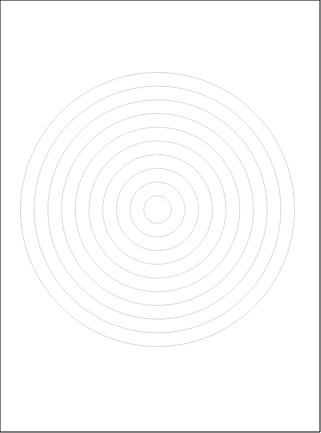
| Category | #REF! | C23 | C22 | C21 | E83 | E82 | E81 | E73 | E72 | E71 | E63 | E62 | E61 | E53 | E52 | E51 | E43 | E42 | E41 | E33 | E32 | E31 | E23 | E22 | E21 | E13 | E12 | E11 | D43 | D42 | D41 | D33 | D32 | D31 | D23 | D22 | D21 | D13 | D12 | D11 |
|---|---|---|---|---|---|---|---|---|---|---|---|---|---|---|---|---|---|---|---|---|---|---|---|---|---|---|---|---|---|---|---|---|---|---|---|---|---|---|---|---|
| 0.0 | 0 | 0 | 0 | 0 | 0 | 0 | 0 | 0 | 0 | 0 | 0 | 0 | 0 | 0 | 0 | 0 | 0 | 0 | 0 | 0 | 0 | 0 | 0 | 0 | 0 | 0 | 0 | 0 | 0 | 0 | 0 | 0 | 0 | 0 | 0 | 0 | 0 | 0 | 0 | 0 |
| 1.0 | 0 | 0 | 0 | 0 | 0 | 0 | 0 | 0 | 0 | 0 | 0 | 0 | 0 | 0 | 0 | 0 | 0 | 0 | 0 | 0 | 0 | 0 | 0 | 0 | 0 | 0 | 0 | 0 | 0 | 0 | 0 | 0 | 0 | 0 | 0 | 0 | 0 | 0 | 0 | 0 |
| 2.0 | 0 | 0 | 0 | 0 | 0 | 0 | 0 | 0 | 0 | 0 | 0 | 0 | 0 | 0 | 0 | 0 | 0 | 0 | 0 | 0 | 0 | 0 | 0 | 0 | 0 | 0 | 0 | 0 | 0 | 0 | 0 | 0 | 0 | 0 | 0 | 0 | 0 | 0 | 0 | 0 |
| 3.0 | 0 | 0 | 0 | 0 | 0 | 0 | 0 | 0 | 0 | 0 | 0 | 0 | 0 | 0 | 0 | 0 | 0 | 0 | 0 | 0 | 0 | 0 | 0 | 0 | 0 | 0 | 0 | 0 | 0 | 0 | 0 | 0 | 0 | 0 | 0 | 0 | 0 | 0 | 0 | 0 |
| 4.0 | 0 | 0 | 0 | 0 | 0 | 0 | 0 | 0 | 0 | 0 | 0 | 0 | 0 | 0 | 0 | 0 | 0 | 0 | 0 | 0 | 0 | 0 | 0 | 0 | 0 | 0 | 0 | 0 | 0 | 0 | 0 | 0 | 0 | 0 | 0 | 0 | 0 | 0 | 0 | 0 |
| 5.0 | 0 | 0 | 0 | 0 | 0 | 0 | 0 | 0 | 0 | 0 | 0 | 0 | 0 | 0 | 0 | 0 | 0 | 0 | 0 | 0 | 0 | 0 | 0 | 0 | 0 | 0 | 0 | 0 | 0 | 0 | 0 | 0 | 0 | 0 | 0 | 0 | 0 | 0 | 0 | 0 |
| 6.0 | 0 | 0 | 0 | 0 | 0 | 0 | 0 | 0 | 0 | 0 | 0 | 0 | 0 | 0 | 0 | 0 | 0 | 0 | 0 | 0 | 0 | 0 | 0 | 0 | 0 | 0 | 0 | 0 | 0 | 0 | 0 | 0 | 0 | 0 | 0 | 0 | 0 | 0 | 0 | 0 |
| 7.0 | 0 | 0 | 0 | 0 | 0 | 0 | 0 | 0 | 0 | 0 | 0 | 0 | 0 | 0 | 0 | 0 | 0 | 0 | 0 | 0 | 0 | 0 | 0 | 0 | 0 | 0 | 0 | 0 | 0 | 0 | 0 | 0 | 0 | 0 | 0 | 0 | 0 | 0 | 0 | 0 |
| 8.0 | 0 | 0 | 0 | 0 | 0 | 0 | 0 | 0 | 0 | 0 | 0 | 0 | 0 | 0 | 0 | 0 | 0 | 0 | 0 | 0 | 0 | 0 | 0 | 0 | 0 | 0 | 0 | 0 | 0 | 0 | 0 | 0 | 0 | 0 | 0 | 0 | 0 | 0 | 0 | 0 |
| 9.0 | 0 | 0 | 0 | 0 | 0 | 0 | 0 | 0 | 0 | 0 | 0 | 0 | 0 | 0 | 0 | 0 | 0 | 0 | 0 | 0 | 0 | 0 | 0 | 0 | 0 | 0 | 0 | 0 | 0 | 0 | 0 | 0 | 0 | 0 | 0 | 0 | 0 | 0 | 0 | 0 |
| 10.0 | 0 | 0 | 0 | 0 | 0 | 0 | 0 | 0 | 0 | 0 | 0 | 0 | 0 | 0 | 0 | 0 | 0 | 0 | 0 | 0 | 0 | 0 | 0 | 0 | 0 | 0 | 0 | 0 | 0 | 0 | 0 | 0 | 0 | 0 | 0 | 0 | 0 | 0 | 0 | 0 |
| 11.0 | 0 | 0 | 0 | 0 | 0 | 0 | 0 | 0 | 0 | 0 | 0 | 0 | 0 | 0 | 0 | 0 | 0 | 0 | 0 | 0 | 0 | 0 | 0 | 0 | 0 | 0 | 0 | 0 | 0 | 0 | 0 | 0 | 0 | 0 | 0 | 0 | 0 | 0 | 0 | 0 |
| 12.0 | 0 | 0 | 0 | 0 | 0 | 0 | 0 | 0 | 0 | 0 | 0 | 0 | 0 | 0 | 0 | 0 | 0 | 0 | 0 | 0 | 0 | 0 | 0 | 0 | 0 | 0 | 0 | 0 | 0 | 0 | 0 | 0 | 0 | 0 | 0 | 0 | 0 | 0 | 0 | 0 |
| 13.0 | 0 | 0 | 0 | 0 | 0 | 0 | 0 | 0 | 0 | 0 | 0 | 0 | 0 | 0 | 0 | 0 | 0 | 0 | 0 | 0 | 0 | 0 | 0 | 0 | 0 | 0 | 0 | 0 | 0 | 0 | 0 | 0 | 0 | 0 | 0 | 0 | 0 | 0 | 0 | 0 |
| 14.0 | 0 | 0 | 0 | 0 | 0 | 0 | 0 | 0 | 0 | 0 | 0 | 0 | 0 | 0 | 0 | 0 | 0 | 0 | 0 | 0 | 0 | 0 | 0 | 0 | 0 | 0 | 0 | 0 | 0 | 0 | 0 | 0 | 0 | 0 | 0 | 0 | 0 | 0 | 0 | 0 |
| 15.0 | 0 | 0 | 0 | 0 | 0 | 0 | 0 | 0 | 0 | 0 | 0 | 0 | 0 | 0 | 0 | 0 | 0 | 0 | 0 | 0 | 0 | 0 | 0 | 0 | 0 | 0 | 0 | 0 | 0 | 0 | 0 | 0 | 0 | 0 | 0 | 0 | 0 | 0 | 0 | 0 |
| 16.0 | 0 | 0 | 0 | 0 | 0 | 0 | 0 | 0 | 0 | 0 | 0 | 0 | 0 | 0 | 0 | 0 | 0 | 0 | 0 | 0 | 0 | 0 | 0 | 0 | 0 | 0 | 0 | 0 | 0 | 0 | 0 | 0 | 0 | 0 | 0 | 0 | 0 | 0 | 0 | 0 |
| 17.0 | 0 | 0 | 0 | 0 | 0 | 0 | 0 | 0 | 0 | 0 | 0 | 0 | 0 | 0 | 0 | 0 | 0 | 0 | 0 | 0 | 0 | 0 | 0 | 0 | 0 | 0 | 0 | 0 | 0 | 0 | 0 | 0 | 0 | 0 | 0 | 0 | 0 | 0 | 0 | 0 |
| 18.0 | 0 | 0 | 0 | 0 | 0 | 0 | 0 | 0 | 0 | 0 | 0 | 0 | 0 | 0 | 0 | 0 | 0 | 0 | 0 | 0 | 0 | 0 | 0 | 0 | 0 | 0 | 0 | 0 | 0 | 0 | 0 | 0 | 0 | 0 | 0 | 0 | 0 | 0 | 0 | 0 |
| 19.0 | 0 | 0 | 0 | 0 | 0 | 0 | 0 | 0 | 0 | 0 | 0 | 0 | 0 | 0 | 0 | 0 | 0 | 0 | 0 | 0 | 0 | 0 | 0 | 0 | 0 | 0 | 0 | 0 | 0 | 0 | 0 | 0 | 0 | 0 | 0 | 0 | 0 | 0 | 0 | 0 |
| 20.0 | 0 | 0 | 0 | 0 | 0 | 0 | 0 | 0 | 0 | 0 | 0 | 0 | 0 | 0 | 0 | 0 | 0 | 0 | 0 | 0 | 0 | 0 | 0 | 0 | 0 | 0 | 0 | 0 | 0 | 0 | 0 | 0 | 0 | 0 | 0 | 0 | 0 | 0 | 0 | 0 |
| 21.0 | 0 | 0 | 0 | 0 | 0 | 0 | 0 | 0 | 0 | 0 | 0 | 0 | 0 | 0 | 0 | 0 | 0 | 0 | 0 | 0 | 0 | 0 | 0 | 0 | 0 | 0 | 0 | 0 | 0 | 0 | 0 | 0 | 0 | 0 | 0 | 0 | 0 | 0 | 0 | 0 |
| 22.0 | 0 | 0 | 0 | 0 | 0 | 0 | 0 | 0 | 0 | 0 | 0 | 0 | 0 | 0 | 0 | 0 | 0 | 0 | 0 | 0 | 0 | 0 | 0 | 0 | 0 | 0 | 0 | 0 | 0 | 0 | 0 | 0 | 0 | 0 | 0 | 0 | 0 | 0 | 0 | 0 |
| 23.0 | 0 | 0 | 0 | 0 | 0 | 0 | 0 | 0 | 0 | 0 | 0 | 0 | 0 | 0 | 0 | 0 | 0 | 0 | 0 | 0 | 0 | 0 | 0 | 0 | 0 | 0 | 0 | 0 | 0 | 0 | 0 | 0 | 0 | 0 | 0 | 0 | 0 | 0 | 0 | 0 |
| 24.0 | 0 | 0 | 0 | 0 | 0 | 0 | 0 | 0 | 0 | 0 | 0 | 0 | 0 | 0 | 0 | 0 | 0 | 0 | 0 | 0 | 0 | 0 | 0 | 0 | 0 | 0 | 0 | 0 | 0 | 0 | 0 | 0 | 0 | 0 | 0 | 0 | 0 | 0 | 0 | 0 |
| 25.0 | 0 | 0 | 0 | 0 | 0 | 0 | 0 | 0 | 0 | 0 | 0 | 0 | 0 | 0 | 0 | 0 | 0 | 0 | 0 | 0 | 0 | 0 | 0 | 0 | 0 | 0 | 0 | 0 | 0 | 0 | 0 | 0 | 0 | 0 | 0 | 0 | 0 | 0 | 0 | 0 |
| 26.0 | 0 | 0 | 0 | 0 | 0 | 0 | 0 | 0 | 0 | 0 | 0 | 0 | 0 | 0 | 0 | 0 | 0 | 0 | 0 | 0 | 0 | 0 | 0 | 0 | 0 | 0 | 0 | 0 | 0 | 0 | 0 | 0 | 0 | 0 | 0 | 0 | 0 | 0 | 0 | 0 |
| 27.0 | 0 | 0 | 0 | 0 | 0 | 0 | 0 | 0 | 0 | 0 | 0 | 0 | 0 | 0 | 0 | 0 | 0 | 0 | 0 | 0 | 0 | 0 | 0 | 0 | 0 | 0 | 0 | 0 | 0 | 0 | 0 | 0 | 0 | 0 | 0 | 0 | 0 | 0 | 0 | 0 |
| 28.0 | 0 | 0 | 0 | 0 | 0 | 0 | 0 | 0 | 0 | 0 | 0 | 0 | 0 | 0 | 0 | 0 | 0 | 0 | 0 | 0 | 0 | 0 | 0 | 0 | 0 | 0 | 0 | 0 | 0 | 0 | 0 | 0 | 0 | 0 | 0 | 0 | 0 | 0 | 0 | 0 |
| 29.0 | 0 | 0 | 0 | 0 | 0 | 0 | 0 | 0 | 0 | 0 | 0 | 0 | 0 | 0 | 0 | 0 | 0 | 0 | 0 | 0 | 0 | 0 | 0 | 0 | 0 | 0 | 0 | 0 | 0 | 0 | 0 | 0 | 0 | 0 | 0 | 0 | 0 | 0 | 0 | 0 |
| 30.0 | 0 | 0 | 0 | 0 | 0 | 0 | 0 | 0 | 0 | 0 | 0 | 0 | 0 | 0 | 0 | 0 | 0 | 0 | 0 | 0 | 0 | 0 | 0 | 0 | 0 | 0 | 0 | 0 | 0 | 0 | 0 | 0 | 0 | 0 | 0 | 0 | 0 | 0 | 0 | 0 |
| 31.0 | 0 | 0 | 0 | 0 | 0 | 0 | 0 | 0 | 0 | 0 | 0 | 0 | 0 | 0 | 0 | 0 | 0 | 0 | 0 | 0 | 0 | 0 | 0 | 0 | 0 | 0 | 0 | 0 | 0 | 0 | 0 | 0 | 0 | 0 | 0 | 0 | 0 | 0 | 0 | 0 |
| 32.0 | 0 | 0 | 0 | 0 | 0 | 0 | 0 | 0 | 0 | 0 | 0 | 0 | 0 | 0 | 0 | 0 | 0 | 0 | 0 | 0 | 0 | 0 | 0 | 0 | 0 | 0 | 0 | 0 | 0 | 0 | 0 | 0 | 0 | 0 | 0 | 0 | 0 | 0 | 0 | 0 |
| 33.0 | 0 | 0 | 0 | 0 | 0 | 0 | 0 | 0 | 0 | 0 | 0 | 0 | 0 | 0 | 0 | 0 | 0 | 0 | 0 | 0 | 0 | 0 | 0 | 0 | 0 | 0 | 0 | 0 | 0 | 0 | 0 | 0 | 0 | 0 | 0 | 0 | 0 | 0 | 0 | 0 |
| 34.0 | 0 | 0 | 0 | 0 | 0 | 0 | 0 | 0 | 0 | 0 | 0 | 0 | 0 | 0 | 0 | 0 | 0 | 0 | 0 | 0 | 0 | 0 | 0 | 0 | 0 | 0 | 0 | 0 | 0 | 0 | 0 | 0 | 0 | 0 | 0 | 0 | 0 | 0 | 0 | 0 |
| 35.0 | 0 | 0 | 0 | 0 | 0 | 0 | 0 | 0 | 0 | 0 | 0 | 0 | 0 | 0 | 0 | 0 | 0 | 0 | 0 | 0 | 0 | 0 | 0 | 0 | 0 | 0 | 0 | 0 | 0 | 0 | 0 | 0 | 0 | 0 | 0 | 0 | 0 | 0 | 0 | 0 |
| 36.0 | 0 | 0 | 0 | 0 | 0 | 0 | 0 | 0 | 0 | 0 | 0 | 0 | 0 | 0 | 0 | 0 | 0 | 0 | 0 | 0 | 0 | 0 | 0 | 0 | 0 | 0 | 0 | 0 | 0 | 0 | 0 | 0 | 0 | 0 | 0 | 0 | 0 | 0 | 0 | 0 |
| 37.0 | 0 | 0 | 0 | 0 | 0 | 0 | 0 | 0 | 0 | 0 | 0 | 0 | 0 | 0 | 0 | 0 | 0 | 0 | 0 | 0 | 0 | 0 | 0 | 0 | 0 | 0 | 0 | 0 | 0 | 0 | 0 | 0 | 0 | 0 | 0 | 0 | 0 | 0 | 0 | 0 |
| 38.0 | 0 | 0 | 0 | 0 | 0 | 0 | 0 | 0 | 0 | 0 | 0 | 0 | 0 | 0 | 0 | 0 | 0 | 0 | 0 | 0 | 0 | 0 | 0 | 0 | 0 | 0 | 0 | 0 | 0 | 0 | 0 | 0 | 0 | 0 | 0 | 0 | 0 | 0 | 0 | 0 |
| 39.0 | 0 | 0 | 0 | 0 | 0 | 0 | 0 | 0 | 0 | 0 | 0 | 0 | 0 | 0 | 0 | 0 | 0 | 0 | 0 | 0 | 0 | 0 | 0 | 0 | 0 | 0 | 0 | 0 | 0 | 0 | 0 | 0 | 0 | 0 | 0 | 0 | 0 | 0 | 0 | 0 |
| 40.0 | 0 | 0 | 0 | 0 | 0 | 0 | 0 | 0 | 0 | 0 | 0 | 0 | 0 | 0 | 0 | 0 | 0 | 0 | 0 | 0 | 0 | 0 | 0 | 0 | 0 | 0 | 0 | 0 | 0 | 0 | 0 | 0 | 0 | 0 | 0 | 0 | 0 | 0 | 0 | 0 |
| 41.0 | 0 | 0 | 0 | 0 | 0 | 0 | 0 | 0 | 0 | 0 | 0 | 0 | 0 | 0 | 0 | 0 | 0 | 0 | 0 | 0 | 0 | 0 | 0 | 0 | 0 | 0 | 0 | 0 | 0 | 0 | 0 | 0 | 0 | 0 | 0 | 0 | 0 | 0 | 0 | 0 |
| 42.0 | 0 | 0 | 0 | 0 | 0 | 0 | 0 | 0 | 0 | 0 | 0 | 0 | 0 | 0 | 0 | 0 | 0 | 0 | 0 | 0 | 0 | 0 | 0 | 0 | 0 | 0 | 0 | 0 | 0 | 0 | 0 | 0 | 0 | 0 | 0 | 0 | 0 | 0 | 0 | 0 |
| 43.0 | 0 | 0 | 0 | 0 | 0 | 0 | 0 | 0 | 0 | 0 | 0 | 0 | 0 | 0 | 0 | 0 | 0 | 0 | 0 | 0 | 0 | 0 | 0 | 0 | 0 | 0 | 0 | 0 | 0 | 0 | 0 | 0 | 0 | 0 | 0 | 0 | 0 | 0 | 0 | 0 |
| 44.0 | 0 | 0 | 0 | 0 | 0 | 0 | 0 | 0 | 0 | 0 | 0 | 0 | 0 | 0 | 0 | 0 | 0 | 0 | 0 | 0 | 0 | 0 | 0 | 0 | 0 | 0 | 0 | 0 | 0 | 0 | 0 | 0 | 0 | 0 | 0 | 0 | 0 | 0 | 0 | 0 |
| 45.0 | 0 | 0 | 0 | 0 | 0 | 0 | 0 | 0 | 0 | 0 | 0 | 0 | 0 | 0 | 0 | 0 | 0 | 0 | 0 | 0 | 0 | 0 | 0 | 0 | 0 | 0 | 0 | 0 | 0 | 0 | 0 | 0 | 0 | 0 | 0 | 0 | 0 | 0 | 0 | 0 |
| 46.0 | 0 | 0 | 0 | 0 | 0 | 0 | 0 | 0 | 0 | 0 | 0 | 0 | 0 | 0 | 0 | 0 | 0 | 0 | 0 | 0 | 0 | 0 | 0 | 0 | 0 | 0 | 0 | 0 | 0 | 0 | 0 | 0 | 0 | 0 | 0 | 0 | 0 | 0 | 0 | 0 |
| 47.0 | 0 | 0 | 0 | 0 | 0 | 0 | 0 | 0 | 0 | 0 | 0 | 0 | 0 | 0 | 0 | 0 | 0 | 0 | 0 | 0 | 0 | 0 | 0 | 0 | 0 | 0 | 0 | 0 | 0 | 0 | 0 | 0 | 0 | 0 | 0 | 0 | 0 | 0 | 0 | 0 |
| 48.0 | 0 | 0 | 0 | 0 | 0 | 0 | 0 | 0 | 0 | 0 | 0 | 0 | 0 | 0 | 0 | 0 | 0 | 0 | 0 | 0 | 0 | 0 | 0 | 0 | 0 | 0 | 0 | 0 | 0 | 0 | 0 | 0 | 0 | 0 | 0 | 0 | 0 | 0 | 0 | 0 |
| 49.0 | 0 | 0 | 0 | 0 | 0 | 0 | 0 | 0 | 0 | 0 | 0 | 0 | 0 | 0 | 0 | 0 | 0 | 0 | 0 | 0 | 0 | 0 | 0 | 0 | 0 | 0 | 0 | 0 | 0 | 0 | 0 | 0 | 0 | 0 | 0 | 0 | 0 | 0 | 0 | 0 |
| 50.0 | 0 | 0 | 0 | 0 | 0 | 0 | 0 | 0 | 0 | 0 | 0 | 0 | 0 | 0 | 0 | 0 | 0 | 0 | 0 | 0 | 0 | 0 | 0 | 0 | 0 | 0 | 0 | 0 | 0 | 0 | 0 | 0 | 0 | 0 | 0 | 0 | 0 | 0 | 0 | 0 |
| 51.0 | 0 | 0 | 0 | 0 | 0 | 0 | 0 | 0 | 0 | 0 | 0 | 0 | 0 | 0 | 0 | 0 | 0 | 0 | 0 | 0 | 0 | 0 | 0 | 0 | 0 | 0 | 0 | 0 | 0 | 0 | 0 | 0 | 0 | 0 | 0 | 0 | 0 | 0 | 0 | 0 |
| 52.0 | 0 | 0 | 0 | 0 | 0 | 0 | 0 | 0 | 0 | 0 | 0 | 0 | 0 | 0 | 0 | 0 | 0 | 0 | 0 | 0 | 0 | 0 | 0 | 0 | 0 | 0 | 0 | 0 | 0 | 0 | 0 | 0 | 0 | 0 | 0 | 0 | 0 | 0 | 0 | 0 |
| 53.0 | 0 | 0 | 0 | 0 | 0 | 0 | 0 | 0 | 0 | 0 | 0 | 0 | 0 | 0 | 0 | 0 | 0 | 0 | 0 | 0 | 0 | 0 | 0 | 0 | 0 | 0 | 0 | 0 | 0 | 0 | 0 | 0 | 0 | 0 | 0 | 0 | 0 | 0 | 0 | 0 |
| 54.0 | 0 | 0 | 0 | 0 | 0 | 0 | 0 | 0 | 0 | 0 | 0 | 0 | 0 | 0 | 0 | 0 | 0 | 0 | 0 | 0 | 0 | 0 | 0 | 0 | 0 | 0 | 0 | 0 | 0 | 0 | 0 | 0 | 0 | 0 | 0 | 0 | 0 | 0 | 0 | 0 |
| 55.0 | 0 | 0 | 0 | 0 | 0 | 0 | 0 | 0 | 0 | 0 | 0 | 0 | 0 | 0 | 0 | 0 | 0 | 0 | 0 | 0 | 0 | 0 | 0 | 0 | 0 | 0 | 0 | 0 | 0 | 0 | 0 | 0 | 0 | 0 | 0 | 0 | 0 | 0 | 0 | 0 |
| 56.0 | 0 | 0 | 0 | 0 | 0 | 0 | 0 | 0 | 0 | 0 | 0 | 0 | 0 | 0 | 0 | 0 | 0 | 0 | 0 | 0 | 0 | 0 | 0 | 0 | 0 | 0 | 0 | 0 | 0 | 0 | 0 | 0 | 0 | 0 | 0 | 0 | 0 | 0 | 0 | 0 |
| 57.0 | 0 | 0 | 0 | 0 | 0 | 0 | 0 | 0 | 0 | 0 | 0 | 0 | 0 | 0 | 0 | 0 | 0 | 0 | 0 | 0 | 0 | 0 | 0 | 0 | 0 | 0 | 0 | 0 | 0 | 0 | 0 | 0 | 0 | 0 | 0 | 0 | 0 | 0 | 0 | 0 |
| 58.0 | 0 | 0 | 0 | 0 | 0 | 0 | 0 | 0 | 0 | 0 | 0 | 0 | 0 | 0 | 0 | 0 | 0 | 0 | 0 | 0 | 0 | 0 | 0 | 0 | 0 | 0 | 0 | 0 | 0 | 0 | 0 | 0 | 0 | 0 | 0 | 0 | 0 | 0 | 0 | 0 |
| 59.0 | 0 | 0 | 0 | 0 | 0 | 0 | 0 | 0 | 0 | 0 | 0 | 0 | 0 | 0 | 0 | 0 | 0 | 0 | 0 | 0 | 0 | 0 | 0 | 0 | 0 | 0 | 0 | 0 | 0 | 0 | 0 | 0 | 0 | 0 | 0 | 0 | 0 | 0 | 0 | 0 |
| 60.0 | 0 | 0 | 0 | 0 | 0 | 0 | 0 | 0 | 0 | 0 | 0 | 0 | 0 | 0 | 0 | 0 | 0 | 0 | 0 | 0 | 0 | 0 | 0 | 0 | 0 | 0 | 0 | 0 | 0 | 0 | 0 | 0 | 0 | 0 | 0 | 0 | 0 | 0 | 0 | 0 |
| 61.0 | 0 | 0 | 0 | 0 | 0 | 0 | 0 | 0 | 0 | 0 | 0 | 0 | 0 | 0 | 0 | 0 | 0 | 0 | 0 | 0 | 0 | 0 | 0 | 0 | 0 | 0 | 0 | 0 | 0 | 0 | 0 | 0 | 0 | 0 | 0 | 0 | 0 | 0 | 0 | 0 |
| 62.0 | 0 | 0 | 0 | 0 | 0 | 0 | 0 | 0 | 0 | 0 | 0 | 0 | 0 | 0 | 0 | 0 | 0 | 0 | 0 | 0 | 0 | 0 | 0 | 0 | 0 | 0 | 0 | 0 | 0 | 0 | 0 | 0 | 0 | 0 | 0 | 0 | 0 | 0 | 0 | 0 |
| 63.0 | 0 | 0 | 0 | 0 | 0 | 0 | 0 | 0 | 0 | 0 | 0 | 0 | 0 | 0 | 0 | 0 | 0 | 0 | 0 | 0 | 0 | 0 | 0 | 0 | 0 | 0 | 0 | 0 | 0 | 0 | 0 | 0 | 0 | 0 | 0 | 0 | 0 | 0 | 0 | 0 |
| 64.0 | 0 | 0 | 0 | 0 | 0 | 0 | 0 | 0 | 0 | 0 | 0 | 0 | 0 | 0 | 0 | 0 | 0 | 0 | 0 | 0 | 0 | 0 | 0 | 0 | 0 | 0 | 0 | 0 | 0 | 0 | 0 | 0 | 0 | 0 | 0 | 0 | 0 | 0 | 0 | 0 |
| 65.0 | 0 | 0 | 0 | 0 | 0 | 0 | 0 | 0 | 0 | 0 | 0 | 0 | 0 | 0 | 0 | 0 | 0 | 0 | 0 | 0 | 0 | 0 | 0 | 0 | 0 | 0 | 0 | 0 | 0 | 0 | 0 | 0 | 0 | 0 | 0 | 0 | 0 | 0 | 0 | 0 |
| 66.0 | 0 | 0 | 0 | 0 | 0 | 0 | 0 | 0 | 0 | 0 | 0 | 0 | 0 | 0 | 0 | 0 | 0 | 0 | 0 | 0 | 0 | 0 | 0 | 0 | 0 | 0 | 0 | 0 | 0 | 0 | 0 | 0 | 0 | 0 | 0 | 0 | 0 | 0 | 0 | 0 |
| 67.0 | 0 | 0 | 0 | 0 | 0 | 0 | 0 | 0 | 0 | 0 | 0 | 0 | 0 | 0 | 0 | 0 | 0 | 0 | 0 | 0 | 0 | 0 | 0 | 0 | 0 | 0 | 0 | 0 | 0 | 0 | 0 | 0 | 0 | 0 | 0 | 0 | 0 | 0 | 0 | 0 |
| 68.0 | 0 | 0 | 0 | 0 | 0 | 0 | 0 | 0 | 0 | 0 | 0 | 0 | 0 | 0 | 0 | 0 | 0 | 0 | 0 | 0 | 0 | 0 | 0 | 0 | 0 | 0 | 0 | 0 | 0 | 0 | 0 | 0 | 0 | 0 | 0 | 0 | 0 | 0 | 0 | 0 |
| 69.0 | 0 | 0 | 0 | 0 | 0 | 0 | 0 | 0 | 0 | 0 | 0 | 0 | 0 | 0 | 0 | 0 | 0 | 0 | 0 | 0 | 0 | 0 | 0 | 0 | 0 | 0 | 0 | 0 | 0 | 0 | 0 | 0 | 0 | 0 | 0 | 0 | 0 | 0 | 0 | 0 |
| 70.0 | 0 | 0 | 0 | 0 | 0 | 0 | 0 | 0 | 0 | 0 | 0 | 0 | 0 | 0 | 0 | 0 | 0 | 0 | 0 | 0 | 0 | 0 | 0 | 0 | 0 | 0 | 0 | 0 | 0 | 0 | 0 | 0 | 0 | 0 | 0 | 0 | 0 | 0 | 0 | 0 |
| 71.0 | 0 | 0 | 0 | 0 | 0 | 0 | 0 | 0 | 0 | 0 | 0 | 0 | 0 | 0 | 0 | 0 | 0 | 0 | 0 | 0 | 0 | 0 | 0 | 0 | 0 | 0 | 0 | 0 | 0 | 0 | 0 | 0 | 0 | 0 | 0 | 0 | 0 | 0 | 0 | 0 |
| 72.0 | 0 | 0 | 0 | 0 | 0 | 0 | 0 | 0 | 0 | 0 | 0 | 0 | 0 | 0 | 0 | 0 | 0 | 0 | 0 | 0 | 0 | 0 | 0 | 0 | 0 | 0 | 0 | 0 | 0 | 0 | 0 | 0 | 0 | 0 | 0 | 0 | 0 | 0 | 0 | 0 |
| 73.0 | 0 | 0 | 0 | 0 | 0 | 0 | 0 | 0 | 0 | 0 | 0 | 0 | 0 | 0 | 0 | 0 | 0 | 0 | 0 | 0 | 0 | 0 | 0 | 0 | 0 | 0 | 0 | 0 | 0 | 0 | 0 | 0 | 0 | 0 | 0 | 0 | 0 | 0 | 0 | 0 |
| 74.0 | 0 | 0 | 0 | 0 | 0 | 0 | 0 | 0 | 0 | 0 | 0 | 0 | 0 | 0 | 0 | 0 | 0 | 0 | 0 | 0 | 0 | 0 | 0 | 0 | 0 | 0 | 0 | 0 | 0 | 0 | 0 | 0 | 0 | 0 | 0 | 0 | 0 | 0 | 0 | 0 |
| 75.0 | 0 | 0 | 0 | 0 | 0 | 0 | 0 | 0 | 0 | 0 | 0 | 0 | 0 | 0 | 0 | 0 | 0 | 0 | 0 | 0 | 0 | 0 | 0 | 0 | 0 | 0 | 0 | 0 | 0 | 0 | 0 | 0 | 0 | 0 | 0 | 0 | 0 | 0 | 0 | 0 |
| 76.0 | 0 | 0 | 0 | 0 | 0 | 0 | 0 | 0 | 0 | 0 | 0 | 0 | 0 | 0 | 0 | 0 | 0 | 0 | 0 | 0 | 0 | 0 | 0 | 0 | 0 | 0 | 0 | 0 | 0 | 0 | 0 | 0 | 0 | 0 | 0 | 0 | 0 | 0 | 0 | 0 |
| 77.0 | 0 | 0 | 0 | 0 | 0 | 0 | 0 | 0 | 0 | 0 | 0 | 0 | 0 | 0 | 0 | 0 | 0 | 0 | 0 | 0 | 0 | 0 | 0 | 0 | 0 | 0 | 0 | 0 | 0 | 0 | 0 | 0 | 0 | 0 | 0 | 0 | 0 | 0 | 0 | 0 |
| 78.0 | 0 | 0 | 0 | 0 | 0 | 0 | 0 | 0 | 0 | 0 | 0 | 0 | 0 | 0 | 0 | 0 | 0 | 0 | 0 | 0 | 0 | 0 | 0 | 0 | 0 | 0 | 0 | 0 | 0 | 0 | 0 | 0 | 0 | 0 | 0 | 0 | 0 | 0 | 0 | 0 |
| 79.0 | 0 | 0 | 0 | 0 | 0 | 0 | 0 | 0 | 0 | 0 | 0 | 0 | 0 | 0 | 0 | 0 | 0 | 0 | 0 | 0 | 0 | 0 | 0 | 0 | 0 | 0 | 0 | 0 | 0 | 0 | 0 | 0 | 0 | 0 | 0 | 0 | 0 | 0 | 0 | 0 |
| 80.0 | 0 | 0 | 0 | 0 | 0 | 0 | 0 | 0 | 0 | 0 | 0 | 0 | 0 | 0 | 0 | 0 | 0 | 0 | 0 | 0 | 0 | 0 | 0 | 0 | 0 | 0 | 0 | 0 | 0 | 0 | 0 | 0 | 0 | 0 | 0 | 0 | 0 | 0 | 0 | 0 |
| 81.0 | 0 | 0 | 0 | 0 | 0 | 0 | 0 | 0 | 0 | 0 | 0 | 0 | 0 | 0 | 0 | 0 | 0 | 0 | 0 | 0 | 0 | 0 | 0 | 0 | 0 | 0 | 0 | 0 | 0 | 0 | 0 | 0 | 0 | 0 | 0 | 0 | 0 | 0 | 0 | 0 |
| 82.0 | 0 | 0 | 0 | 0 | 0 | 0 | 0 | 0 | 0 | 0 | 0 | 0 | 0 | 0 | 0 | 0 | 0 | 0 | 0 | 0 | 0 | 0 | 0 | 0 | 0 | 0 | 0 | 0 | 0 | 0 | 0 | 0 | 0 | 0 | 0 | 0 | 0 | 0 | 0 | 0 |
| 83.0 | 0 | 0 | 0 | 0 | 0 | 0 | 0 | 0 | 0 | 0 | 0 | 0 | 0 | 0 | 0 | 0 | 0 | 0 | 0 | 0 | 0 | 0 | 0 | 0 | 0 | 0 | 0 | 0 | 0 | 0 | 0 | 0 | 0 | 0 | 0 | 0 | 0 | 0 | 0 | 0 |
| 84.0 | 0 | 0 | 0 | 0 | 0 | 0 | 0 | 0 | 0 | 0 | 0 | 0 | 0 | 0 | 0 | 0 | 0 | 0 | 0 | 0 | 0 | 0 | 0 | 0 | 0 | 0 | 0 | 0 | 0 | 0 | 0 | 0 | 0 | 0 | 0 | 0 | 0 | 0 | 0 | 0 |
| 85.0 | 0 | 0 | 0 | 0 | 0 | 0 | 0 | 0 | 0 | 0 | 0 | 0 | 0 | 0 | 0 | 0 | 0 | 0 | 0 | 0 | 0 | 0 | 0 | 0 | 0 | 0 | 0 | 0 | 0 | 0 | 0 | 0 | 0 | 0 | 0 | 0 | 0 | 0 | 0 | 0 |
| 86.0 | 0 | 0 | 0 | 0 | 0 | 0 | 0 | 0 | 0 | 0 | 0 | 0 | 0 | 0 | 0 | 0 | 0 | 0 | 0 | 0 | 0 | 0 | 0 | 0 | 0 | 0 | 0 | 0 | 0 | 0 | 0 | 0 | 0 | 0 | 0 | 0 | 0 | 0 | 0 | 0 |
| 87.0 | 0 | 0 | 0 | 0 | 0 | 0 | 0 | 0 | 0 | 0 | 0 | 0 | 0 | 0 | 0 | 0 | 0 | 0 | 0 | 0 | 0 | 0 | 0 | 0 | 0 | 0 | 0 | 0 | 0 | 0 | 0 | 0 | 0 | 0 | 0 | 0 | 0 | 0 | 0 | 0 |
| 88.0 | 0 | 0 | 0 | 0 | 0 | 0 | 0 | 0 | 0 | 0 | 0 | 0 | 0 | 0 | 0 | 0 | 0 | 0 | 0 | 0 | 0 | 0 | 0 | 0 | 0 | 0 | 0 | 0 | 0 | 0 | 0 | 0 | 0 | 0 | 0 | 0 | 0 | 0 | 0 | 0 |
| 89.0 | 0 | 0 | 0 | 0 | 0 | 0 | 0 | 0 | 0 | 0 | 0 | 0 | 0 | 0 | 0 | 0 | 0 | 0 | 0 | 0 | 0 | 0 | 0 | 0 | 0 | 0 | 0 | 0 | 0 | 0 | 0 | 0 | 0 | 0 | 0 | 0 | 0 | 0 | 0 | 0 |
| 90.0 | 0 | 0 | 0 | 0 | 0 | 0 | 0 | 0 | 0 | 0 | 0 | 0 | 0 | 0 | 0 | 0 | 0 | 0 | 0 | 0 | 0 | 0 | 0 | 0 | 0 | 0 | 0 | 0 | 0 | 0 | 0 | 0 | 0 | 0 | 0 | 0 | 0 | 0 | 0 | 0 |
| 91.0 | 0 | 0 | 0 | 0 | 0 | 0 | 0 | 0 | 0 | 0 | 0 | 0 | 0 | 0 | 0 | 0 | 0 | 0 | 0 | 0 | 0 | 0 | 0 | 0 | 0 | 0 | 0 | 0 | 0 | 0 | 0 | 0 | 0 | 0 | 0 | 0 | 0 | 0 | 0 | 0 |
| 92.0 | 0 | 0 | 0 | 0 | 0 | 0 | 0 | 0 | 0 | 0 | 0 | 0 | 0 | 0 | 0 | 0 | 0 | 0 | 0 | 0 | 0 | 0 | 0 | 0 | 0 | 0 | 0 | 0 | 0 | 0 | 0 | 0 | 0 | 0 | 0 | 0 | 0 | 0 | 0 | 0 |
| 93.0 | 0 | 0 | 0 | 0 | 0 | 0 | 0 | 0 | 0 | 0 | 0 | 0 | 0 | 0 | 0 | 0 | 0 | 0 | 0 | 0 | 0 | 0 | 0 | 0 | 0 | 0 | 0 | 0 | 0 | 0 | 0 | 0 | 0 | 0 | 0 | 0 | 0 | 0 | 0 | 0 |
| 94.0 | 0 | 0 | 0 | 0 | 0 | 0 | 0 | 0 | 0 | 0 | 0 | 0 | 0 | 0 | 0 | 0 | 0 | 0 | 0 | 0 | 0 | 0 | 0 | 0 | 0 | 0 | 0 | 0 | 0 | 0 | 0 | 0 | 0 | 0 | 0 | 0 | 0 | 0 | 0 | 0 |
| 95.0 | 0 | 0 | 0 | 0 | 0 | 0 | 0 | 0 | 0 | 0 | 0 | 0 | 0 | 0 | 0 | 0 | 0 | 0 | 0 | 0 | 0 | 0 | 0 | 0 | 0 | 0 | 0 | 0 | 0 | 0 | 0 | 0 | 0 | 0 | 0 | 0 | 0 | 0 | 0 | 0 |
| 96.0 | 0 | 0 | 0 | 0 | 0 | 0 | 0 | 0 | 0 | 0 | 0 | 0 | 0 | 0 | 0 | 0 | 0 | 0 | 0 | 0 | 0 | 0 | 0 | 0 | 0 | 0 | 0 | 0 | 0 | 0 | 0 | 0 | 0 | 0 | 0 | 0 | 0 | 0 | 0 | 0 |
| 97.0 | 0 | 0 | 0 | 0 | 0 | 0 | 0 | 0 | 0 | 0 | 0 | 0 | 0 | 0 | 0 | 0 | 0 | 0 | 0 | 0 | 0 | 0 | 0 | 0 | 0 | 0 | 0 | 0 | 0 | 0 | 0 | 0 | 0 | 0 | 0 | 0 | 0 | 0 | 0 | 0 |
| 98.0 | 0 | 0 | 0 | 0 | 0 | 0 | 0 | 0 | 0 | 0 | 0 | 0 | 0 | 0 | 0 | 0 | 0 | 0 | 0 | 0 | 0 | 0 | 0 | 0 | 0 | 0 | 0 | 0 | 0 | 0 | 0 | 0 | 0 | 0 | 0 | 0 | 0 | 0 | 0 | 0 |
| 99.0 | 0 | 0 | 0 | 0 | 0 | 0 | 0 | 0 | 0 | 0 | 0 | 0 | 0 | 0 | 0 | 0 | 0 | 0 | 0 | 0 | 0 | 0 | 0 | 0 | 0 | 0 | 0 | 0 | 0 | 0 | 0 | 0 | 0 | 0 | 0 | 0 | 0 | 0 | 0 | 0 |
| 100.0 | 0 | 0 | 0 | 0 | 0 | 0 | 0 | 0 | 0 | 0 | 0 | 0 | 0 | 0 | 0 | 0 | 0 | 0 | 0 | 0 | 0 | 0 | 0 | 0 | 0 | 0 | 0 | 0 | 0 | 0 | 0 | 0 | 0 | 0 | 0 | 0 | 0 | 0 | 0 | 0 |
| 101.0 | 0 | 0 | 0 | 0 | 0 | 0 | 0 | 0 | 0 | 0 | 0 | 0 | 0 | 0 | 0 | 0 | 0 | 0 | 0 | 0 | 0 | 0 | 0 | 0 | 0 | 0 | 0 | 0 | 0 | 0 | 0 | 0 | 0 | 0 | 0 | 0 | 0 | 0 | 0 | 0 |
| 102.0 | 0 | 0 | 0 | 0 | 0 | 0 | 0 | 0 | 0 | 0 | 0 | 0 | 0 | 0 | 0 | 0 | 0 | 0 | 0 | 0 | 0 | 0 | 0 | 0 | 0 | 0 | 0 | 0 | 0 | 0 | 0 | 0 | 0 | 0 | 0 | 0 | 0 | 0 | 0 | 0 |
| 103.0 | 0 | 0 | 0 | 0 | 0 | 0 | 0 | 0 | 0 | 0 | 0 | 0 | 0 | 0 | 0 | 0 | 0 | 0 | 0 | 0 | 0 | 0 | 0 | 0 | 0 | 0 | 0 | 0 | 0 | 0 | 0 | 0 | 0 | 0 | 0 | 0 | 0 | 0 | 0 | 0 |
| 104.0 | 0 | 0 | 0 | 0 | 0 | 0 | 0 | 0 | 0 | 0 | 0 | 0 | 0 | 0 | 0 | 0 | 0 | 0 | 0 | 0 | 0 | 0 | 0 | 0 | 0 | 0 | 0 | 0 | 0 | 0 | 0 | 0 | 0 | 0 | 0 | 0 | 0 | 0 | 0 | 0 |
| 105.0 | 0 | 0 | 0 | 0 | 0 | 0 | 0 | 0 | 0 | 0 | 0 | 0 | 0 | 0 | 0 | 0 | 0 | 0 | 0 | 0 | 0 | 0 | 0 | 0 | 0 | 0 | 0 | 0 | 0 | 0 | 0 | 0 | 0 | 0 | 0 | 0 | 0 | 0 | 0 | 0 |
| 106.0 | 0 | 0 | 0 | 0 | 0 | 0 | 0 | 0 | 0 | 0 | 0 | 0 | 0 | 0 | 0 | 0 | 0 | 0 | 0 | 0 | 0 | 0 | 0 | 0 | 0 | 0 | 0 | 0 | 0 | 0 | 0 | 0 | 0 | 0 | 0 | 0 | 0 | 0 | 0 | 0 |
| 107.0 | 0 | 0 | 0 | 0 | 0 | 0 | 0 | 0 | 0 | 0 | 0 | 0 | 0 | 0 | 0 | 0 | 0 | 0 | 0 | 0 | 0 | 0 | 0 | 0 | 0 | 0 | 0 | 0 | 0 | 0 | 0 | 0 | 0 | 0 | 0 | 0 | 0 | 0 | 0 | 0 |
| 108.0 | 0 | 0 | 0 | 0 | 0 | 0 | 0 | 0 | 0 | 0 | 0 | 0 | 0 | 0 | 0 | 0 | 0 | 0 | 0 | 0 | 0 | 0 | 0 | 0 | 0 | 0 | 0 | 0 | 0 | 0 | 0 | 0 | 0 | 0 | 0 | 0 | 0 | 0 | 0 | 0 |
| 109.0 | 0 | 0 | 0 | 0 | 0 | 0 | 0 | 0 | 0 | 0 | 0 | 0 | 0 | 0 | 0 | 0 | 0 | 0 | 0 | 0 | 0 | 0 | 0 | 0 | 0 | 0 | 0 | 0 | 0 | 0 | 0 | 0 | 0 | 0 | 0 | 0 | 0 | 0 | 0 | 0 |
| 110.0 | 0 | 0 | 0 | 0 | 0 | 0 | 0 | 0 | 0 | 0 | 0 | 0 | 0 | 0 | 0 | 0 | 0 | 0 | 0 | 0 | 0 | 0 | 0 | 0 | 0 | 0 | 0 | 0 | 0 | 0 | 0 | 0 | 0 | 0 | 0 | 0 | 0 | 0 | 0 | 0 |
| 111.0 | 0 | 0 | 0 | 0 | 0 | 0 | 0 | 0 | 0 | 0 | 0 | 0 | 0 | 0 | 0 | 0 | 0 | 0 | 0 | 0 | 0 | 0 | 0 | 0 | 0 | 0 | 0 | 0 | 0 | 0 | 0 | 0 | 0 | 0 | 0 | 0 | 0 | 0 | 0 | 0 |
| 112.0 | 0 | 0 | 0 | 0 | 0 | 0 | 0 | 0 | 0 | 0 | 0 | 0 | 0 | 0 | 0 | 0 | 0 | 0 | 0 | 0 | 0 | 0 | 0 | 0 | 0 | 0 | 0 | 0 | 0 | 0 | 0 | 0 | 0 | 0 | 0 | 0 | 0 | 0 | 0 | 0 |
| 113.0 | 0 | 0 | 0 | 0 | 0 | 0 | 0 | 0 | 0 | 0 | 0 | 0 | 0 | 0 | 0 | 0 | 0 | 0 | 0 | 0 | 0 | 0 | 0 | 0 | 0 | 0 | 0 | 0 | 0 | 0 | 0 | 0 | 0 | 0 | 0 | 0 | 0 | 0 | 0 | 0 |
| 114.0 | 0 | 0 | 0 | 0 | 0 | 0 | 0 | 0 | 0 | 0 | 0 | 0 | 0 | 0 | 0 | 0 | 0 | 0 | 0 | 0 | 0 | 0 | 0 | 0 | 0 | 0 | 0 | 0 | 0 | 0 | 0 | 0 | 0 | 0 | 0 | 0 | 0 | 0 | 0 | 0 |
| 115.0 | 0 | 0 | 0 | 0 | 0 | 0 | 0 | 0 | 0 | 0 | 0 | 0 | 0 | 0 | 0 | 0 | 0 | 0 | 0 | 0 | 0 | 0 | 0 | 0 | 0 | 0 | 0 | 0 | 0 | 0 | 0 | 0 | 0 | 0 | 0 | 0 | 0 | 0 | 0 | 0 |
| 116.0 | 0 | 0 | 0 | 0 | 0 | 0 | 0 | 0 | 0 | 0 | 0 | 0 | 0 | 0 | 0 | 0 | 0 | 0 | 0 | 0 | 0 | 0 | 0 | 0 | 0 | 0 | 0 | 0 | 0 | 0 | 0 | 0 | 0 | 0 | 0 | 0 | 0 | 0 | 0 | 0 |
| 117.0 | 0 | 0 | 0 | 0 | 0 | 0 | 0 | 0 | 0 | 0 | 0 | 0 | 0 | 0 | 0 | 0 | 0 | 0 | 0 | 0 | 0 | 0 | 0 | 0 | 0 | 0 | 0 | 0 | 0 | 0 | 0 | 0 | 0 | 0 | 0 | 0 | 0 | 0 | 0 | 0 |
| 118.0 | 0 | 0 | 0 | 0 | 0 | 0 | 0 | 0 | 0 | 0 | 0 | 0 | 0 | 0 | 0 | 0 | 0 | 0 | 0 | 0 | 0 | 0 | 0 | 0 | 0 | 0 | 0 | 0 | 0 | 0 | 0 | 0 | 0 | 0 | 0 | 0 | 0 | 0 | 0 | 0 |
| 119.0 | 0 | 0 | 0 | 0 | 0 | 0 | 0 | 0 | 0 | 0 | 0 | 0 | 0 | 0 | 0 | 0 | 0 | 0 | 0 | 0 | 0 | 0 | 0 | 0 | 0 | 0 | 0 | 0 | 0 | 0 | 0 | 0 | 0 | 0 | 0 | 0 | 0 | 0 | 0 | 0 |
| 120.0 | 0 | 0 | 0 | 0 | 0 | 0 | 0 | 0 | 0 | 0 | 0 | 0 | 0 | 0 | 0 | 0 | 0 | 0 | 0 | 0 | 0 | 0 | 0 | 0 | 0 | 0 | 0 | 0 | 0 | 0 | 0 | 0 | 0 | 0 | 0 | 0 | 0 | 0 | 0 | 0 |
| 121.0 | 0 | 0 | 0 | 0 | 0 | 0 | 0 | 0 | 0 | 0 | 0 | 0 | 0 | 0 | 0 | 0 | 0 | 0 | 0 | 0 | 0 | 0 | 0 | 0 | 0 | 0 | 0 | 0 | 0 | 0 | 0 | 0 | 0 | 0 | 0 | 0 | 0 | 0 | 0 | 0 |
| 122.0 | 0 | 0 | 0 | 0 | 0 | 0 | 0 | 0 | 0 | 0 | 0 | 0 | 0 | 0 | 0 | 0 | 0 | 0 | 0 | 0 | 0 | 0 | 0 | 0 | 0 | 0 | 0 | 0 | 0 | 0 | 0 | 0 | 0 | 0 | 0 | 0 | 0 | 0 | 0 | 0 |
| 123.0 | 0 | 0 | 0 | 0 | 0 | 0 | 0 | 0 | 0 | 0 | 0 | 0 | 0 | 0 | 0 | 0 | 0 | 0 | 0 | 0 | 0 | 0 | 0 | 0 | 0 | 0 | 0 | 0 | 0 | 0 | 0 | 0 | 0 | 0 | 0 | 0 | 0 | 0 | 0 | 0 |
| 124.0 | 0 | 0 | 0 | 0 | 0 | 0 | 0 | 0 | 0 | 0 | 0 | 0 | 0 | 0 | 0 | 0 | 0 | 0 | 0 | 0 | 0 | 0 | 0 | 0 | 0 | 0 | 0 | 0 | 0 | 0 | 0 | 0 | 0 | 0 | 0 | 0 | 0 | 0 | 0 | 0 |
| 125.0 | 0 | 0 | 0 | 0 | 0 | 0 | 0 | 0 | 0 | 0 | 0 | 0 | 0 | 0 | 0 | 0 | 0 | 0 | 0 | 0 | 0 | 0 | 0 | 0 | 0 | 0 | 0 | 0 | 0 | 0 | 0 | 0 | 0 | 0 | 0 | 0 | 0 | 0 | 0 | 0 |
| 126.0 | 0 | 0 | 0 | 0 | 0 | 0 | 0 | 0 | 0 | 0 | 0 | 0 | 0 | 0 | 0 | 0 | 0 | 0 | 0 | 0 | 0 | 0 | 0 | 0 | 0 | 0 | 0 | 0 | 0 | 0 | 0 | 0 | 0 | 0 | 0 | 0 | 0 | 0 | 0 | 0 |
| 127.0 | 0 | 0 | 0 | 0 | 0 | 0 | 0 | 0 | 0 | 0 | 0 | 0 | 0 | 0 | 0 | 0 | 0 | 0 | 0 | 0 | 0 | 0 | 0 | 0 | 0 | 0 | 0 | 0 | 0 | 0 | 0 | 0 | 0 | 0 | 0 | 0 | 0 | 0 | 0 | 0 |
| 128.0 | 0 | 0 | 0 | 0 | 0 | 0 | 0 | 0 | 0 | 0 | 0 | 0 | 0 | 0 | 0 | 0 | 0 | 0 | 0 | 0 | 0 | 0 | 0 | 0 | 0 | 0 | 0 | 0 | 0 | 0 | 0 | 0 | 0 | 0 | 0 | 0 | 0 | 0 | 0 | 0 |
| 129.0 | 0 | 0 | 0 | 0 | 0 | 0 | 0 | 0 | 0 | 0 | 0 | 0 | 0 | 0 | 0 | 0 | 0 | 0 | 0 | 0 | 0 | 0 | 0 | 0 | 0 | 0 | 0 | 0 | 0 | 0 | 0 | 0 | 0 | 0 | 0 | 0 | 0 | 0 | 0 | 0 |
| 130.0 | 0 | 0 | 0 | 0 | 0 | 0 | 0 | 0 | 0 | 0 | 0 | 0 | 0 | 0 | 0 | 0 | 0 | 0 | 0 | 0 | 0 | 0 | 0 | 0 | 0 | 0 | 0 | 0 | 0 | 0 | 0 | 0 | 0 | 0 | 0 | 0 | 0 | 0 | 0 | 0 |
| 131.0 | 0 | 0 | 0 | 0 | 0 | 0 | 0 | 0 | 0 | 0 | 0 | 0 | 0 | 0 | 0 | 0 | 0 | 0 | 0 | 0 | 0 | 0 | 0 | 0 | 0 | 0 | 0 | 0 | 0 | 0 | 0 | 0 | 0 | 0 | 0 | 0 | 0 | 0 | 0 | 0 |
| 132.0 | 0 | 0 | 0 | 0 | 0 | 0 | 0 | 0 | 0 | 0 | 0 | 0 | 0 | 0 | 0 | 0 | 0 | 0 | 0 | 0 | 0 | 0 | 0 | 0 | 0 | 0 | 0 | 0 | 0 | 0 | 0 | 0 | 0 | 0 | 0 | 0 | 0 | 0 | 0 | 0 |
| 133.0 | 0 | 0 | 0 | 0 | 0 | 0 | 0 | 0 | 0 | 0 | 0 | 0 | 0 | 0 | 0 | 0 | 0 | 0 | 0 | 0 | 0 | 0 | 0 | 0 | 0 | 0 | 0 | 0 | 0 | 0 | 0 | 0 | 0 | 0 | 0 | 0 | 0 | 0 | 0 | 0 |
| 134.0 | 0 | 0 | 0 | 0 | 0 | 0 | 0 | 0 | 0 | 0 | 0 | 0 | 0 | 0 | 0 | 0 | 0 | 0 | 0 | 0 | 0 | 0 | 0 | 0 | 0 | 0 | 0 | 0 | 0 | 0 | 0 | 0 | 0 | 0 | 0 | 0 | 0 | 0 | 0 | 0 |
| 135.0 | 0 | 0 | 0 | 0 | 0 | 0 | 0 | 0 | 0 | 0 | 0 | 0 | 0 | 0 | 0 | 0 | 0 | 0 | 0 | 0 | 0 | 0 | 0 | 0 | 0 | 0 | 0 | 0 | 0 | 0 | 0 | 0 | 0 | 0 | 0 | 0 | 0 | 0 | 0 | 0 |
| 136.0 | 0 | 0 | 0 | 0 | 0 | 0 | 0 | 0 | 0 | 0 | 0 | 0 | 0 | 0 | 0 | 0 | 0 | 0 | 0 | 0 | 0 | 0 | 0 | 0 | 0 | 0 | 0 | 0 | 0 | 0 | 0 | 0 | 0 | 0 | 0 | 0 | 0 | 0 | 0 | 0 |
| 137.0 | 0 | 0 | 0 | 0 | 0 | 0 | 0 | 0 | 0 | 0 | 0 | 0 | 0 | 0 | 0 | 0 | 0 | 0 | 0 | 0 | 0 | 0 | 0 | 0 | 0 | 0 | 0 | 0 | 0 | 0 | 0 | 0 | 0 | 0 | 0 | 0 | 0 | 0 | 0 | 0 |
| 138.0 | 0 | 0 | 0 | 0 | 0 | 0 | 0 | 0 | 0 | 0 | 0 | 0 | 0 | 0 | 0 | 0 | 0 | 0 | 0 | 0 | 0 | 0 | 0 | 0 | 0 | 0 | 0 | 0 | 0 | 0 | 0 | 0 | 0 | 0 | 0 | 0 | 0 | 0 | 0 | 0 |
| 139.0 | 0 | 0 | 0 | 0 | 0 | 0 | 0 | 0 | 0 | 0 | 0 | 0 | 0 | 0 | 0 | 0 | 0 | 0 | 0 | 0 | 0 | 0 | 0 | 0 | 0 | 0 | 0 | 0 | 0 | 0 | 0 | 0 | 0 | 0 | 0 | 0 | 0 | 0 | 0 | 0 |
| 140.0 | 0 | 0 | 0 | 0 | 0 | 0 | 0 | 0 | 0 | 0 | 0 | 0 | 0 | 0 | 0 | 0 | 0 | 0 | 0 | 0 | 0 | 0 | 0 | 0 | 0 | 0 | 0 | 0 | 0 | 0 | 0 | 0 | 0 | 0 | 0 | 0 | 0 | 0 | 0 | 0 |
| 141.0 | 0 | 0 | 0 | 0 | 0 | 0 | 0 | 0 | 0 | 0 | 0 | 0 | 0 | 0 | 0 | 0 | 0 | 0 | 0 | 0 | 0 | 0 | 0 | 0 | 0 | 0 | 0 | 0 | 0 | 0 | 0 | 0 | 0 | 0 | 0 | 0 | 0 | 0 | 0 | 0 |
| 142.0 | 0 | 0 | 0 | 0 | 0 | 0 | 0 | 0 | 0 | 0 | 0 | 0 | 0 | 0 | 0 | 0 | 0 | 0 | 0 | 0 | 0 | 0 | 0 | 0 | 0 | 0 | 0 | 0 | 0 | 0 | 0 | 0 | 0 | 0 | 0 | 0 | 0 | 0 | 0 | 0 |
| 143.0 | 0 | 0 | 0 | 0 | 0 | 0 | 0 | 0 | 0 | 0 | 0 | 0 | 0 | 0 | 0 | 0 | 0 | 0 | 0 | 0 | 0 | 0 | 0 | 0 | 0 | 0 | 0 | 0 | 0 | 0 | 0 | 0 | 0 | 0 | 0 | 0 | 0 | 0 | 0 | 0 |
| 144.0 | 0 | 0 | 0 | 0 | 0 | 0 | 0 | 0 | 0 | 0 | 0 | 0 | 0 | 0 | 0 | 0 | 0 | 0 | 0 | 0 | 0 | 0 | 0 | 0 | 0 | 0 | 0 | 0 | 0 | 0 | 0 | 0 | 0 | 0 | 0 | 0 | 0 | 0 | 0 | 0 |
| 145.0 | 0 | 0 | 0 | 0 | 0 | 0 | 0 | 0 | 0 | 0 | 0 | 0 | 0 | 0 | 0 | 0 | 0 | 0 | 0 | 0 | 0 | 0 | 0 | 0 | 0 | 0 | 0 | 0 | 0 | 0 | 0 | 0 | 0 | 0 | 0 | 0 | 0 | 0 | 0 | 0 |
| 146.0 | 0 | 0 | 0 | 0 | 0 | 0 | 0 | 0 | 0 | 0 | 0 | 0 | 0 | 0 | 0 | 0 | 0 | 0 | 0 | 0 | 0 | 0 | 0 | 0 | 0 | 0 | 0 | 0 | 0 | 0 | 0 | 0 | 0 | 0 | 0 | 0 | 0 | 0 | 0 | 0 |
| 147.0 | 0 | 0 | 0 | 0 | 0 | 0 | 0 | 0 | 0 | 0 | 0 | 0 | 0 | 0 | 0 | 0 | 0 | 0 | 0 | 0 | 0 | 0 | 0 | 0 | 0 | 0 | 0 | 0 | 0 | 0 | 0 | 0 | 0 | 0 | 0 | 0 | 0 | 0 | 0 | 0 |
| 148.0 | 0 | 0 | 0 | 0 | 0 | 0 | 0 | 0 | 0 | 0 | 0 | 0 | 0 | 0 | 0 | 0 | 0 | 0 | 0 | 0 | 0 | 0 | 0 | 0 | 0 | 0 | 0 | 0 | 0 | 0 | 0 | 0 | 0 | 0 | 0 | 0 | 0 | 0 | 0 | 0 |
| 149.0 | 0 | 0 | 0 | 0 | 0 | 0 | 0 | 0 | 0 | 0 | 0 | 0 | 0 | 0 | 0 | 0 | 0 | 0 | 0 | 0 | 0 | 0 | 0 | 0 | 0 | 0 | 0 | 0 | 0 | 0 | 0 | 0 | 0 | 0 | 0 | 0 | 0 | 0 | 0 | 0 |
| 150.0 | 0 | 0 | 0 | 0 | 0 | 0 | 0 | 0 | 0 | 0 | 0 | 0 | 0 | 0 | 0 | 0 | 0 | 0 | 0 | 0 | 0 | 0 | 0 | 0 | 0 | 0 | 0 | 0 | 0 | 0 | 0 | 0 | 0 | 0 | 0 | 0 | 0 | 0 | 0 | 0 |
| 151.0 | 0 | 0 | 0 | 0 | 0 | 0 | 0 | 0 | 0 | 0 | 0 | 0 | 0 | 0 | 0 | 0 | 0 | 0 | 0 | 0 | 0 | 0 | 0 | 0 | 0 | 0 | 0 | 0 | 0 | 0 | 0 | 0 | 0 | 0 | 0 | 0 | 0 | 0 | 0 | 0 |
| 152.0 | 0 | 0 | 0 | 0 | 0 | 0 | 0 | 0 | 0 | 0 | 0 | 0 | 0 | 0 | 0 | 0 | 0 | 0 | 0 | 0 | 0 | 0 | 0 | 0 | 0 | 0 | 0 | 0 | 0 | 0 | 0 | 0 | 0 | 0 | 0 | 0 | 0 | 0 | 0 | 0 |
| 153.0 | 0 | 0 | 0 | 0 | 0 | 0 | 0 | 0 | 0 | 0 | 0 | 0 | 0 | 0 | 0 | 0 | 0 | 0 | 0 | 0 | 0 | 0 | 0 | 0 | 0 | 0 | 0 | 0 | 0 | 0 | 0 | 0 | 0 | 0 | 0 | 0 | 0 | 0 | 0 | 0 |
| 154.0 | 0 | 0 | 0 | 0 | 0 | 0 | 0 | 0 | 0 | 0 | 0 | 0 | 0 | 0 | 0 | 0 | 0 | 0 | 0 | 0 | 0 | 0 | 0 | 0 | 0 | 0 | 0 | 0 | 0 | 0 | 0 | 0 | 0 | 0 | 0 | 0 | 0 | 0 | 0 | 0 |
| 155.0 | 0 | 0 | 0 | 0 | 0 | 0 | 0 | 0 | 0 | 0 | 0 | 0 | 0 | 0 | 0 | 0 | 0 | 0 | 0 | 0 | 0 | 0 | 0 | 0 | 0 | 0 | 0 | 0 | 0 | 0 | 0 | 0 | 0 | 0 | 0 | 0 | 0 | 0 | 0 | 0 |
| 156.0 | 0 | 0 | 0 | 0 | 0 | 0 | 0 | 0 | 0 | 0 | 0 | 0 | 0 | 0 | 0 | 0 | 0 | 0 | 0 | 0 | 0 | 0 | 0 | 0 | 0 | 0 | 0 | 0 | 0 | 0 | 0 | 0 | 0 | 0 | 0 | 0 | 0 | 0 | 0 | 0 |
| 157.0 | 0 | 0 | 0 | 0 | 0 | 0 | 0 | 0 | 0 | 0 | 0 | 0 | 0 | 0 | 0 | 0 | 0 | 0 | 0 | 0 | 0 | 0 | 0 | 0 | 0 | 0 | 0 | 0 | 0 | 0 | 0 | 0 | 0 | 0 | 0 | 0 | 0 | 0 | 0 | 0 |
| 158.0 | 0 | 0 | 0 | 0 | 0 | 0 | 0 | 0 | 0 | 0 | 0 | 0 | 0 | 0 | 0 | 0 | 0 | 0 | 0 | 0 | 0 | 0 | 0 | 0 | 0 | 0 | 0 | 0 | 0 | 0 | 0 | 0 | 0 | 0 | 0 | 0 | 0 | 0 | 0 | 0 |
| 159.0 | 0 | 0 | 0 | 0 | 0 | 0 | 0 | 0 | 0 | 0 | 0 | 0 | 0 | 0 | 0 | 0 | 0 | 0 | 0 | 0 | 0 | 0 | 0 | 0 | 0 | 0 | 0 | 0 | 0 | 0 | 0 | 0 | 0 | 0 | 0 | 0 | 0 | 0 | 0 | 0 |
| 160.0 | 0 | 0 | 0 | 0 | 0 | 0 | 0 | 0 | 0 | 0 | 0 | 0 | 0 | 0 | 0 | 0 | 0 | 0 | 0 | 0 | 0 | 0 | 0 | 0 | 0 | 0 | 0 | 0 | 0 | 0 | 0 | 0 | 0 | 0 | 0 | 0 | 0 | 0 | 0 | 0 |
| 161.0 | 0 | 0 | 0 | 0 | 0 | 0 | 0 | 0 | 0 | 0 | 0 | 0 | 0 | 0 | 0 | 0 | 0 | 0 | 0 | 0 | 0 | 0 | 0 | 0 | 0 | 0 | 0 | 0 | 0 | 0 | 0 | 0 | 0 | 0 | 0 | 0 | 0 | 0 | 0 | 0 |
| 162.0 | 0 | 0 | 0 | 0 | 0 | 0 | 0 | 0 | 0 | 0 | 0 | 0 | 0 | 0 | 0 | 0 | 0 | 0 | 0 | 0 | 0 | 0 | 0 | 0 | 0 | 0 | 0 | 0 | 0 | 0 | 0 | 0 | 0 | 0 | 0 | 0 | 0 | 0 | 0 | 0 |
| 163.0 | 0 | 0 | 0 | 0 | 0 | 0 | 0 | 0 | 0 | 0 | 0 | 0 | 0 | 0 | 0 | 0 | 0 | 0 | 0 | 0 | 0 | 0 | 0 | 0 | 0 | 0 | 0 | 0 | 0 | 0 | 0 | 0 | 0 | 0 | 0 | 0 | 0 | 0 | 0 | 0 |
| 164.0 | 0 | 0 | 0 | 0 | 0 | 0 | 0 | 0 | 0 | 0 | 0 | 0 | 0 | 0 | 0 | 0 | 0 | 0 | 0 | 0 | 0 | 0 | 0 | 0 | 0 | 0 | 0 | 0 | 0 | 0 | 0 | 0 | 0 | 0 | 0 | 0 | 0 | 0 | 0 | 0 |
| 165.0 | 0 | 0 | 0 | 0 | 0 | 0 | 0 | 0 | 0 | 0 | 0 | 0 | 0 | 0 | 0 | 0 | 0 | 0 | 0 | 0 | 0 | 0 | 0 | 0 | 0 | 0 | 0 | 0 | 0 | 0 | 0 | 0 | 0 | 0 | 0 | 0 | 0 | 0 | 0 | 0 |
| 166.0 | 0 | 0 | 0 | 0 | 0 | 0 | 0 | 0 | 0 | 0 | 0 | 0 | 0 | 0 | 0 | 0 | 0 | 0 | 0 | 0 | 0 | 0 | 0 | 0 | 0 | 0 | 0 | 0 | 0 | 0 | 0 | 0 | 0 | 0 | 0 | 0 | 0 | 0 | 0 | 0 |
| 167.0 | 0 | 0 | 0 | 0 | 0 | 0 | 0 | 0 | 0 | 0 | 0 | 0 | 0 | 0 | 0 | 0 | 0 | 0 | 0 | 0 | 0 | 0 | 0 | 0 | 0 | 0 | 0 | 0 | 0 | 0 | 0 | 0 | 0 | 0 | 0 | 0 | 0 | 0 | 0 | 0 |
| 168.0 | 0 | 0 | 0 | 0 | 0 | 0 | 0 | 0 | 0 | 0 | 0 | 0 | 0 | 0 | 0 | 0 | 0 | 0 | 0 | 0 | 0 | 0 | 0 | 0 | 0 | 0 | 0 | 0 | 0 | 0 | 0 | 0 | 0 | 0 | 0 | 0 | 0 | 0 | 0 | 0 |
| 169.0 | 0 | 0 | 0 | 0 | 0 | 0 | 0 | 0 | 0 | 0 | 0 | 0 | 0 | 0 | 0 | 0 | 0 | 0 | 0 | 0 | 0 | 0 | 0 | 0 | 0 | 0 | 0 | 0 | 0 | 0 | 0 | 0 | 0 | 0 | 0 | 0 | 0 | 0 | 0 | 0 |
| 170.0 | 0 | 0 | 0 | 0 | 0 | 0 | 0 | 0 | 0 | 0 | 0 | 0 | 0 | 0 | 0 | 0 | 0 | 0 | 0 | 0 | 0 | 0 | 0 | 0 | 0 | 0 | 0 | 0 | 0 | 0 | 0 | 0 | 0 | 0 | 0 | 0 | 0 | 0 | 0 | 0 |
| 171.0 | 0 | 0 | 0 | 0 | 0 | 0 | 0 | 0 | 0 | 0 | 0 | 0 | 0 | 0 | 0 | 0 | 0 | 0 | 0 | 0 | 0 | 0 | 0 | 0 | 0 | 0 | 0 | 0 | 0 | 0 | 0 | 0 | 0 | 0 | 0 | 0 | 0 | 0 | 0 | 0 |
| 172.0 | 0 | 0 | 0 | 0 | 0 | 0 | 0 | 0 | 0 | 0 | 0 | 0 | 0 | 0 | 0 | 0 | 0 | 0 | 0 | 0 | 0 | 0 | 0 | 0 | 0 | 0 | 0 | 0 | 0 | 0 | 0 | 0 | 0 | 0 | 0 | 0 | 0 | 0 | 0 | 0 |
| 173.0 | 0 | 0 | 0 | 0 | 0 | 0 | 0 | 0 | 0 | 0 | 0 | 0 | 0 | 0 | 0 | 0 | 0 | 0 | 0 | 0 | 0 | 0 | 0 | 0 | 0 | 0 | 0 | 0 | 0 | 0 | 0 | 0 | 0 | 0 | 0 | 0 | 0 | 0 | 0 | 0 |
| 174.0 | 0 | 0 | 0 | 0 | 0 | 0 | 0 | 0 | 0 | 0 | 0 | 0 | 0 | 0 | 0 | 0 | 0 | 0 | 0 | 0 | 0 | 0 | 0 | 0 | 0 | 0 | 0 | 0 | 0 | 0 | 0 | 0 | 0 | 0 | 0 | 0 | 0 | 0 | 0 | 0 |
| 175.0 | 0 | 0 | 0 | 0 | 0 | 0 | 0 | 0 | 0 | 0 | 0 | 0 | 0 | 0 | 0 | 0 | 0 | 0 | 0 | 0 | 0 | 0 | 0 | 0 | 0 | 0 | 0 | 0 | 0 | 0 | 0 | 0 | 0 | 0 | 0 | 0 | 0 | 0 | 0 | 0 |
| 176.0 | 0 | 0 | 0 | 0 | 0 | 0 | 0 | 0 | 0 | 0 | 0 | 0 | 0 | 0 | 0 | 0 | 0 | 0 | 0 | 0 | 0 | 0 | 0 | 0 | 0 | 0 | 0 | 0 | 0 | 0 | 0 | 0 | 0 | 0 | 0 | 0 | 0 | 0 | 0 | 0 |
| 177.0 | 0 | 0 | 0 | 0 | 0 | 0 | 0 | 0 | 0 | 0 | 0 | 0 | 0 | 0 | 0 | 0 | 0 | 0 | 0 | 0 | 0 | 0 | 0 | 0 | 0 | 0 | 0 | 0 | 0 | 0 | 0 | 0 | 0 | 0 | 0 | 0 | 0 | 0 | 0 | 0 |
| 178.0 | 0 | 0 | 0 | 0 | 0 | 0 | 0 | 0 | 0 | 0 | 0 | 0 | 0 | 0 | 0 | 0 | 0 | 0 | 0 | 0 | 0 | 0 | 0 | 0 | 0 | 0 | 0 | 0 | 0 | 0 | 0 | 0 | 0 | 0 | 0 | 0 | 0 | 0 | 0 | 0 |
| 179.0 | 0 | 0 | 0 | 0 | 0 | 0 | 0 | 0 | 0 | 0 | 0 | 0 | 0 | 0 | 0 | 0 | 0 | 0 | 0 | 0 | 0 | 0 | 0 | 0 | 0 | 0 | 0 | 0 | 0 | 0 | 0 | 0 | 0 | 0 | 0 | 0 | 0 | 0 | 0 | 0 |
| 180.0 | 0 | 0 | 0 | 0 | 0 | 0 | 0 | 0 | 0 | 0 | 0 | 0 | 0 | 0 | 0 | 0 | 0 | 0 | 0 | 0 | 0 | 0 | 0 | 0 | 0 | 0 | 0 | 0 | 0 | 0 | 0 | 0 | 0 | 0 | 0 | 0 | 0 | 0 | 0 | 0 |
| 181.0 | 0 | 0 | 0 | 0 | 0 | 0 | 0 | 0 | 0 | 0 | 0 | 0 | 0 | 0 | 0 | 0 | 0 | 0 | 0 | 0 | 0 | 0 | 0 | 0 | 0 | 0 | 0 | 0 | 0 | 0 | 0 | 0 | 0 | 0 | 0 | 0 | 0 | 0 | 0 | 0 |
| 182.0 | 0 | 0 | 0 | 0 | 0 | 0 | 0 | 0 | 0 | 0 | 0 | 0 | 0 | 0 | 0 | 0 | 0 | 0 | 0 | 0 | 0 | 0 | 0 | 0 | 0 | 0 | 0 | 0 | 0 | 0 | 0 | 0 | 0 | 0 | 0 | 0 | 0 | 0 | 0 | 0 |
| 183.0 | 0 | 0 | 0 | 0 | 0 | 0 | 0 | 0 | 0 | 0 | 0 | 0 | 0 | 0 | 0 | 0 | 0 | 0 | 0 | 0 | 0 | 0 | 0 | 0 | 0 | 0 | 0 | 0 | 0 | 0 | 0 | 0 | 0 | 0 | 0 | 0 | 0 | 0 | 0 | 0 |
| 184.0 | 0 | 0 | 0 | 0 | 0 | 0 | 0 | 0 | 0 | 0 | 0 | 0 | 0 | 0 | 0 | 0 | 0 | 0 | 0 | 0 | 0 | 0 | 0 | 0 | 0 | 0 | 0 | 0 | 0 | 0 | 0 | 0 | 0 | 0 | 0 | 0 | 0 | 0 | 0 | 0 |
| 185.0 | 0 | 0 | 0 | 0 | 0 | 0 | 0 | 0 | 0 | 0 | 0 | 0 | 0 | 0 | 0 | 0 | 0 | 0 | 0 | 0 | 0 | 0 | 0 | 0 | 0 | 0 | 0 | 0 | 0 | 0 | 0 | 0 | 0 | 0 | 0 | 0 | 0 | 0 | 0 | 0 |
| 186.0 | 0 | 0 | 0 | 0 | 0 | 0 | 0 | 0 | 0 | 0 | 0 | 0 | 0 | 0 | 0 | 0 | 0 | 0 | 0 | 0 | 0 | 0 | 0 | 0 | 0 | 0 | 0 | 0 | 0 | 0 | 0 | 0 | 0 | 0 | 0 | 0 | 0 | 0 | 0 | 0 |
| 187.0 | 0 | 0 | 0 | 0 | 0 | 0 | 0 | 0 | 0 | 0 | 0 | 0 | 0 | 0 | 0 | 0 | 0 | 0 | 0 | 0 | 0 | 0 | 0 | 0 | 0 | 0 | 0 | 0 | 0 | 0 | 0 | 0 | 0 | 0 | 0 | 0 | 0 | 0 | 0 | 0 |
| 188.0 | 0 | 0 | 0 | 0 | 0 | 0 | 0 | 0 | 0 | 0 | 0 | 0 | 0 | 0 | 0 | 0 | 0 | 0 | 0 | 0 | 0 | 0 | 0 | 0 | 0 | 0 | 0 | 0 | 0 | 0 | 0 | 0 | 0 | 0 | 0 | 0 | 0 | 0 | 0 | 0 |
| 189.0 | 0 | 0 | 0 | 0 | 0 | 0 | 0 | 0 | 0 | 0 | 0 | 0 | 0 | 0 | 0 | 0 | 0 | 0 | 0 | 0 | 0 | 0 | 0 | 0 | 0 | 0 | 0 | 0 | 0 | 0 | 0 | 0 | 0 | 0 | 0 | 0 | 0 | 0 | 0 | 0 |
| 190.0 | 0 | 0 | 0 | 0 | 0 | 0 | 0 | 0 | 0 | 0 | 0 | 0 | 0 | 0 | 0 | 0 | 0 | 0 | 0 | 0 | 0 | 0 | 0 | 0 | 0 | 0 | 0 | 0 | 0 | 0 | 0 | 0 | 0 | 0 | 0 | 0 | 0 | 0 | 0 | 0 |
| 191.0 | 0 | 0 | 0 | 0 | 0 | 0 | 0 | 0 | 0 | 0 | 0 | 0 | 0 | 0 | 0 | 0 | 0 | 0 | 0 | 0 | 0 | 0 | 0 | 0 | 0 | 0 | 0 | 0 | 0 | 0 | 0 | 0 | 0 | 0 | 0 | 0 | 0 | 0 | 0 | 0 |
| 192.0 | 0 | 0 | 0 | 0 | 0 | 0 | 0 | 0 | 0 | 0 | 0 | 0 | 0 | 0 | 0 | 0 | 0 | 0 | 0 | 0 | 0 | 0 | 0 | 0 | 0 | 0 | 0 | 0 | 0 | 0 | 0 | 0 | 0 | 0 | 0 | 0 | 0 | 0 | 0 | 0 |
| 193.0 | 0 | 0 | 0 | 0 | 0 | 0 | 0 | 0 | 0 | 0 | 0 | 0 | 0 | 0 | 0 | 0 | 0 | 0 | 0 | 0 | 0 | 0 | 0 | 0 | 0 | 0 | 0 | 0 | 0 | 0 | 0 | 0 | 0 | 0 | 0 | 0 | 0 | 0 | 0 | 0 |
| 194.0 | 0 | 0 | 0 | 0 | 0 | 0 | 0 | 0 | 0 | 0 | 0 | 0 | 0 | 0 | 0 | 0 | 0 | 0 | 0 | 0 | 0 | 0 | 0 | 0 | 0 | 0 | 0 | 0 | 0 | 0 | 0 | 0 | 0 | 0 | 0 | 0 | 0 | 0 | 0 | 0 |
| 195.0 | 0 | 0 | 0 | 0 | 0 | 0 | 0 | 0 | 0 | 0 | 0 | 0 | 0 | 0 | 0 | 0 | 0 | 0 | 0 | 0 | 0 | 0 | 0 | 0 | 0 | 0 | 0 | 0 | 0 | 0 | 0 | 0 | 0 | 0 | 0 | 0 | 0 | 0 | 0 | 0 |
| 196.0 | 0 | 0 | 0 | 0 | 0 | 0 | 0 | 0 | 0 | 0 | 0 | 0 | 0 | 0 | 0 | 0 | 0 | 0 | 0 | 0 | 0 | 0 | 0 | 0 | 0 | 0 | 0 | 0 | 0 | 0 | 0 | 0 | 0 | 0 | 0 | 0 | 0 | 0 | 0 | 0 |
| 197.0 | 0 | 0 | 0 | 0 | 0 | 0 | 0 | 0 | 0 | 0 | 0 | 0 | 0 | 0 | 0 | 0 | 0 | 0 | 0 | 0 | 0 | 0 | 0 | 0 | 0 | 0 | 0 | 0 | 0 | 0 | 0 | 0 | 0 | 0 | 0 | 0 | 0 | 0 | 0 | 0 |
| 198.0 | 0 | 0 | 0 | 0 | 0 | 0 | 0 | 0 | 0 | 0 | 0 | 0 | 0 | 0 | 0 | 0 | 0 | 0 | 0 | 0 | 0 | 0 | 0 | 0 | 0 | 0 | 0 | 0 | 0 | 0 | 0 | 0 | 0 | 0 | 0 | 0 | 0 | 0 | 0 | 0 |
| 199.0 | 0 | 0 | 0 | 0 | 0 | 0 | 0 | 0 | 0 | 0 | 0 | 0 | 0 | 0 | 0 | 0 | 0 | 0 | 0 | 0 | 0 | 0 | 0 | 0 | 0 | 0 | 0 | 0 | 0 | 0 | 0 | 0 | 0 | 0 | 0 | 0 | 0 | 0 | 0 | 0 |
| 200.0 | 0 | 0 | 0 | 0 | 0 | 0 | 0 | 0 | 0 | 0 | 0 | 0 | 0 | 0 | 0 | 0 | 0 | 0 | 0 | 0 | 0 | 0 | 0 | 0 | 0 | 0 | 0 | 0 | 0 | 0 | 0 | 0 | 0 | 0 | 0 | 0 | 0 | 0 | 0 | 0 |
| 201.0 | 0 | 0 | 0 | 0 | 0 | 0 | 0 | 0 | 0 | 0 | 0 | 0 | 0 | 0 | 0 | 0 | 0 | 0 | 0 | 0 | 0 | 0 | 0 | 0 | 0 | 0 | 0 | 0 | 0 | 0 | 0 | 0 | 0 | 0 | 0 | 0 | 0 | 0 | 0 | 0 |
| 202.0 | 0 | 0 | 0 | 0 | 0 | 0 | 0 | 0 | 0 | 0 | 0 | 0 | 0 | 0 | 0 | 0 | 0 | 0 | 0 | 0 | 0 | 0 | 0 | 0 | 0 | 0 | 0 | 0 | 0 | 0 | 0 | 0 | 0 | 0 | 0 | 0 | 0 | 0 | 0 | 0 |
| 203.0 | 0 | 0 | 0 | 0 | 0 | 0 | 0 | 0 | 0 | 0 | 0 | 0 | 0 | 0 | 0 | 0 | 0 | 0 | 0 | 0 | 0 | 0 | 0 | 0 | 0 | 0 | 0 | 0 | 0 | 0 | 0 | 0 | 0 | 0 | 0 | 0 | 0 | 0 | 0 | 0 |
| 204.0 | 0 | 0 | 0 | 0 | 0 | 0 | 0 | 0 | 0 | 0 | 0 | 0 | 0 | 0 | 0 | 0 | 0 | 0 | 0 | 0 | 0 | 0 | 0 | 0 | 0 | 0 | 0 | 0 | 0 | 0 | 0 | 0 | 0 | 0 | 0 | 0 | 0 | 0 | 0 | 0 |
| 205.0 | 0 | 0 | 0 | 0 | 0 | 0 | 0 | 0 | 0 | 0 | 0 | 0 | 0 | 0 | 0 | 0 | 0 | 0 | 0 | 0 | 0 | 0 | 0 | 0 | 0 | 0 | 0 | 0 | 0 | 0 | 0 | 0 | 0 | 0 | 0 | 0 | 0 | 0 | 0 | 0 |
| 206.0 | 0 | 0 | 0 | 0 | 0 | 0 | 0 | 0 | 0 | 0 | 0 | 0 | 0 | 0 | 0 | 0 | 0 | 0 | 0 | 0 | 0 | 0 | 0 | 0 | 0 | 0 | 0 | 0 | 0 | 0 | 0 | 0 | 0 | 0 | 0 | 0 | 0 | 0 | 0 | 0 |
| 207.0 | 0 | 0 | 0 | 0 | 0 | 0 | 0 | 0 | 0 | 0 | 0 | 0 | 0 | 0 | 0 | 0 | 0 | 0 | 0 | 0 | 0 | 0 | 0 | 0 | 0 | 0 | 0 | 0 | 0 | 0 | 0 | 0 | 0 | 0 | 0 | 0 | 0 | 0 | 0 | 0 |
| 208.0 | 0 | 0 | 0 | 0 | 0 | 0 | 0 | 0 | 0 | 0 | 0 | 0 | 0 | 0 | 0 | 0 | 0 | 0 | 0 | 0 | 0 | 0 | 0 | 0 | 0 | 0 | 0 | 0 | 0 | 0 | 0 | 0 | 0 | 0 | 0 | 0 | 0 | 0 | 0 | 0 |
| 209.0 | 0 | 0 | 0 | 0 | 0 | 0 | 0 | 0 | 0 | 0 | 0 | 0 | 0 | 0 | 0 | 0 | 0 | 0 | 0 | 0 | 0 | 0 | 0 | 0 | 0 | 0 | 0 | 0 | 0 | 0 | 0 | 0 | 0 | 0 | 0 | 0 | 0 | 0 | 0 | 0 |
| 210.0 | 0 | 0 | 0 | 0 | 0 | 0 | 0 | 0 | 0 | 0 | 0 | 0 | 0 | 0 | 0 | 0 | 0 | 0 | 0 | 0 | 0 | 0 | 0 | 0 | 0 | 0 | 0 | 0 | 0 | 0 | 0 | 0 | 0 | 0 | 0 | 0 | 0 | 0 | 0 | 0 |
| 211.0 | 0 | 0 | 0 | 0 | 0 | 0 | 0 | 0 | 0 | 0 | 0 | 0 | 0 | 0 | 0 | 0 | 0 | 0 | 0 | 0 | 0 | 0 | 0 | 0 | 0 | 0 | 0 | 0 | 0 | 0 | 0 | 0 | 0 | 0 | 0 | 0 | 0 | 0 | 0 | 0 |
| 212.0 | 0 | 0 | 0 | 0 | 0 | 0 | 0 | 0 | 0 | 0 | 0 | 0 | 0 | 0 | 0 | 0 | 0 | 0 | 0 | 0 | 0 | 0 | 0 | 0 | 0 | 0 | 0 | 0 | 0 | 0 | 0 | 0 | 0 | 0 | 0 | 0 | 0 | 0 | 0 | 0 |
| 213.0 | 0 | 0 | 0 | 0 | 0 | 0 | 0 | 0 | 0 | 0 | 0 | 0 | 0 | 0 | 0 | 0 | 0 | 0 | 0 | 0 | 0 | 0 | 0 | 0 | 0 | 0 | 0 | 0 | 0 | 0 | 0 | 0 | 0 | 0 | 0 | 0 | 0 | 0 | 0 | 0 |
| 214.0 | 0 | 0 | 0 | 0 | 0 | 0 | 0 | 0 | 0 | 0 | 0 | 0 | 0 | 0 | 0 | 0 | 0 | 0 | 0 | 0 | 0 | 0 | 0 | 0 | 0 | 0 | 0 | 0 | 0 | 0 | 0 | 0 | 0 | 0 | 0 | 0 | 0 | 0 | 0 | 0 |
| 215.0 | 0 | 0 | 0 | 0 | 0 | 0 | 0 | 0 | 0 | 0 | 0 | 0 | 0 | 0 | 0 | 0 | 0 | 0 | 0 | 0 | 0 | 0 | 0 | 0 | 0 | 0 | 0 | 0 | 0 | 0 | 0 | 0 | 0 | 0 | 0 | 0 | 0 | 0 | 0 | 0 |
| 216.0 | 0 | 0 | 0 | 0 | 0 | 0 | 0 | 0 | 0 | 0 | 0 | 0 | 0 | 0 | 0 | 0 | 0 | 0 | 0 | 0 | 0 | 0 | 0 | 0 | 0 | 0 | 0 | 0 | 0 | 0 | 0 | 0 | 0 | 0 | 0 | 0 | 0 | 0 | 0 | 0 |
| 217.0 | 0 | 0 | 0 | 0 | 0 | 0 | 0 | 0 | 0 | 0 | 0 | 0 | 0 | 0 | 0 | 0 | 0 | 0 | 0 | 0 | 0 | 0 | 0 | 0 | 0 | 0 | 0 | 0 | 0 | 0 | 0 | 0 | 0 | 0 | 0 | 0 | 0 | 0 | 0 | 0 |
| 218.0 | 0 | 0 | 0 | 0 | 0 | 0 | 0 | 0 | 0 | 0 | 0 | 0 | 0 | 0 | 0 | 0 | 0 | 0 | 0 | 0 | 0 | 0 | 0 | 0 | 0 | 0 | 0 | 0 | 0 | 0 | 0 | 0 | 0 | 0 | 0 | 0 | 0 | 0 | 0 | 0 |
| 219.0 | 0 | 0 | 0 | 0 | 0 | 0 | 0 | 0 | 0 | 0 | 0 | 0 | 0 | 0 | 0 | 0 | 0 | 0 | 0 | 0 | 0 | 0 | 0 | 0 | 0 | 0 | 0 | 0 | 0 | 0 | 0 | 0 | 0 | 0 | 0 | 0 | 0 | 0 | 0 | 0 |
| 220.0 | 0 | 0 | 0 | 0 | 0 | 0 | 0 | 0 | 0 | 0 | 0 | 0 | 0 | 0 | 0 | 0 | 0 | 0 | 0 | 0 | 0 | 0 | 0 | 0 | 0 | 0 | 0 | 0 | 0 | 0 | 0 | 0 | 0 | 0 | 0 | 0 | 0 | 0 | 0 | 0 |
| 221.0 | 0 | 0 | 0 | 0 | 0 | 0 | 0 | 0 | 0 | 0 | 0 | 0 | 0 | 0 | 0 | 0 | 0 | 0 | 0 | 0 | 0 | 0 | 0 | 0 | 0 | 0 | 0 | 0 | 0 | 0 | 0 | 0 | 0 | 0 | 0 | 0 | 0 | 0 | 0 | 0 |
| 222.0 | 0 | 0 | 0 | 0 | 0 | 0 | 0 | 0 | 0 | 0 | 0 | 0 | 0 | 0 | 0 | 0 | 0 | 0 | 0 | 0 | 0 | 0 | 0 | 0 | 0 | 0 | 0 | 0 | 0 | 0 | 0 | 0 | 0 | 0 | 0 | 0 | 0 | 0 | 0 | 0 |
| 223.0 | 0 | 0 | 0 | 0 | 0 | 0 | 0 | 0 | 0 | 0 | 0 | 0 | 0 | 0 | 0 | 0 | 0 | 0 | 0 | 0 | 0 | 0 | 0 | 0 | 0 | 0 | 0 | 0 | 0 | 0 | 0 | 0 | 0 | 0 | 0 | 0 | 0 | 0 | 0 | 0 |
| 224.0 | 0 | 0 | 0 | 0 | 0 | 0 | 0 | 0 | 0 | 0 | 0 | 0 | 0 | 0 | 0 | 0 | 0 | 0 | 0 | 0 | 0 | 0 | 0 | 0 | 0 | 0 | 0 | 0 | 0 | 0 | 0 | 0 | 0 | 0 | 0 | 0 | 0 | 0 | 0 | 0 |
| 225.0 | 0 | 0 | 0 | 0 | 0 | 0 | 0 | 0 | 0 | 0 | 0 | 0 | 0 | 0 | 0 | 0 | 0 | 0 | 0 | 0 | 0 | 0 | 0 | 0 | 0 | 0 | 0 | 0 | 0 | 0 | 0 | 0 | 0 | 0 | 0 | 0 | 0 | 0 | 0 | 0 |
| 226.0 | 0 | 0 | 0 | 0 | 0 | 0 | 0 | 0 | 0 | 0 | 0 | 0 | 0 | 0 | 0 | 0 | 0 | 0 | 0 | 0 | 0 | 0 | 0 | 0 | 0 | 0 | 0 | 0 | 0 | 0 | 0 | 0 | 0 | 0 | 0 | 0 | 0 | 0 | 0 | 0 |
| 227.0 | 0 | 0 | 0 | 0 | 0 | 0 | 0 | 0 | 0 | 0 | 0 | 0 | 0 | 0 | 0 | 0 | 0 | 0 | 0 | 0 | 0 | 0 | 0 | 0 | 0 | 0 | 0 | 0 | 0 | 0 | 0 | 0 | 0 | 0 | 0 | 0 | 0 | 0 | 0 | 0 |
| 228.0 | 0 | 0 | 0 | 0 | 0 | 0 | 0 | 0 | 0 | 0 | 0 | 0 | 0 | 0 | 0 | 0 | 0 | 0 | 0 | 0 | 0 | 0 | 0 | 0 | 0 | 0 | 0 | 0 | 0 | 0 | 0 | 0 | 0 | 0 | 0 | 0 | 0 | 0 | 0 | 0 |
| 229.0 | 0 | 0 | 0 | 0 | 0 | 0 | 0 | 0 | 0 | 0 | 0 | 0 | 0 | 0 | 0 | 0 | 0 | 0 | 0 | 0 | 0 | 0 | 0 | 0 | 0 | 0 | 0 | 0 | 0 | 0 | 0 | 0 | 0 | 0 | 0 | 0 | 0 | 0 | 0 | 0 |
| 230.0 | 0 | 0 | 0 | 0 | 0 | 0 | 0 | 0 | 0 | 0 | 0 | 0 | 0 | 0 | 0 | 0 | 0 | 0 | 0 | 0 | 0 | 0 | 0 | 0 | 0 | 0 | 0 | 0 | 0 | 0 | 0 | 0 | 0 | 0 | 0 | 0 | 0 | 0 | 0 | 0 |
| 231.0 | 0 | 0 | 0 | 0 | 0 | 0 | 0 | 0 | 0 | 0 | 0 | 0 | 0 | 0 | 0 | 0 | 0 | 0 | 0 | 0 | 0 | 0 | 0 | 0 | 0 | 0 | 0 | 0 | 0 | 0 | 0 | 0 | 0 | 0 | 0 | 0 | 0 | 0 | 0 | 0 |
| 232.0 | 0 | 0 | 0 | 0 | 0 | 0 | 0 | 0 | 0 | 0 | 0 | 0 | 0 | 0 | 0 | 0 | 0 | 0 | 0 | 0 | 0 | 0 | 0 | 0 | 0 | 0 | 0 | 0 | 0 | 0 | 0 | 0 | 0 | 0 | 0 | 0 | 0 | 0 | 0 | 0 |
| 233.0 | 0 | 0 | 0 | 0 | 0 | 0 | 0 | 0 | 0 | 0 | 0 | 0 | 0 | 0 | 0 | 0 | 0 | 0 | 0 | 0 | 0 | 0 | 0 | 0 | 0 | 0 | 0 | 0 | 0 | 0 | 0 | 0 | 0 | 0 | 0 | 0 | 0 | 0 | 0 | 0 |
| 234.0 | 0 | 0 | 0 | 0 | 0 | 0 | 0 | 0 | 0 | 0 | 0 | 0 | 0 | 0 | 0 | 0 | 0 | 0 | 0 | 0 | 0 | 0 | 0 | 0 | 0 | 0 | 0 | 0 | 0 | 0 | 0 | 0 | 0 | 0 | 0 | 0 | 0 | 0 | 0 | 0 |
| 235.0 | 0 | 0 | 0 | 0 | 0 | 0 | 0 | 0 | 0 | 0 | 0 | 0 | 0 | 0 | 0 | 0 | 0 | 0 | 0 | 0 | 0 | 0 | 0 | 0 | 0 | 0 | 0 | 0 | 0 | 0 | 0 | 0 | 0 | 0 | 0 | 0 | 0 | 0 | 0 | 0 |
| 236.0 | 0 | 0 | 0 | 0 | 0 | 0 | 0 | 0 | 0 | 0 | 0 | 0 | 0 | 0 | 0 | 0 | 0 | 0 | 0 | 0 | 0 | 0 | 0 | 0 | 0 | 0 | 0 | 0 | 0 | 0 | 0 | 0 | 0 | 0 | 0 | 0 | 0 | 0 | 0 | 0 |
| 237.0 | 0 | 0 | 0 | 0 | 0 | 0 | 0 | 0 | 0 | 0 | 0 | 0 | 0 | 0 | 0 | 0 | 0 | 0 | 0 | 0 | 0 | 0 | 0 | 0 | 0 | 0 | 0 | 0 | 0 | 0 | 0 | 0 | 0 | 0 | 0 | 0 | 0 | 0 | 0 | 0 |
| 238.0 | 0 | 0 | 0 | 0 | 0 | 0 | 0 | 0 | 0 | 0 | 0 | 0 | 0 | 0 | 0 | 0 | 0 | 0 | 0 | 0 | 0 | 0 | 0 | 0 | 0 | 0 | 0 | 0 | 0 | 0 | 0 | 0 | 0 | 0 | 0 | 0 | 0 | 0 | 0 | 0 |
| 239.0 | 0 | 0 | 0 | 0 | 0 | 0 | 0 | 0 | 0 | 0 | 0 | 0 | 0 | 0 | 0 | 0 | 0 | 0 | 0 | 0 | 0 | 0 | 0 | 0 | 0 | 0 | 0 | 0 | 0 | 0 | 0 | 0 | 0 | 0 | 0 | 0 | 0 | 0 | 0 | 0 |
| 240.0 | 0 | 0 | 0 | 0 | 0 | 0 | 0 | 0 | 0 | 0 | 0 | 0 | 0 | 0 | 0 | 0 | 0 | 0 | 0 | 0 | 0 | 0 | 0 | 0 | 0 | 0 | 0 | 0 | 0 | 0 | 0 | 0 | 0 | 0 | 0 | 0 | 0 | 0 | 0 | 0 |
| 241.0 | 0 | 0 | 0 | 0 | 0 | 0 | 0 | 0 | 0 | 0 | 0 | 0 | 0 | 0 | 0 | 0 | 0 | 0 | 0 | 0 | 0 | 0 | 0 | 0 | 0 | 0 | 0 | 0 | 0 | 0 | 0 | 0 | 0 | 0 | 0 | 0 | 0 | 0 | 0 | 0 |
| 242.0 | 0 | 0 | 0 | 0 | 0 | 0 | 0 | 0 | 0 | 0 | 0 | 0 | 0 | 0 | 0 | 0 | 0 | 0 | 0 | 0 | 0 | 0 | 0 | 0 | 0 | 0 | 0 | 0 | 0 | 0 | 0 | 0 | 0 | 0 | 0 | 0 | 0 | 0 | 0 | 0 |
| 243.0 | 0 | 0 | 0 | 0 | 0 | 0 | 0 | 0 | 0 | 0 | 0 | 0 | 0 | 0 | 0 | 0 | 0 | 0 | 0 | 0 | 0 | 0 | 0 | 0 | 0 | 0 | 0 | 0 | 0 | 0 | 0 | 0 | 0 | 0 | 0 | 0 | 0 | 0 | 0 | 0 |
| 244.0 | 0 | 0 | 0 | 0 | 0 | 0 | 0 | 0 | 0 | 0 | 0 | 0 | 0 | 0 | 0 | 0 | 0 | 0 | 0 | 0 | 0 | 0 | 0 | 0 | 0 | 0 | 0 | 0 | 0 | 0 | 0 | 0 | 0 | 0 | 0 | 0 | 0 | 0 | 0 | 0 |
| 245.0 | 0 | 0 | 0 | 0 | 0 | 0 | 0 | 0 | 0 | 0 | 0 | 0 | 0 | 0 | 0 | 0 | 0 | 0 | 0 | 0 | 0 | 0 | 0 | 0 | 0 | 0 | 0 | 0 | 0 | 0 | 0 | 0 | 0 | 0 | 0 | 0 | 0 | 0 | 0 | 0 |
| 246.0 | 0 | 0 | 0 | 0 | 0 | 0 | 0 | 0 | 0 | 0 | 0 | 0 | 0 | 0 | 0 | 0 | 0 | 0 | 0 | 0 | 0 | 0 | 0 | 0 | 0 | 0 | 0 | 0 | 0 | 0 | 0 | 0 | 0 | 0 | 0 | 0 | 0 | 0 | 0 | 0 |
| 247.0 | 0 | 0 | 0 | 0 | 0 | 0 | 0 | 0 | 0 | 0 | 0 | 0 | 0 | 0 | 0 | 0 | 0 | 0 | 0 | 0 | 0 | 0 | 0 | 0 | 0 | 0 | 0 | 0 | 0 | 0 | 0 | 0 | 0 | 0 | 0 | 0 | 0 | 0 | 0 | 0 |
| 248.0 | 0 | 0 | 0 | 0 | 0 | 0 | 0 | 0 | 0 | 0 | 0 | 0 | 0 | 0 | 0 | 0 | 0 | 0 | 0 | 0 | 0 | 0 | 0 | 0 | 0 | 0 | 0 | 0 | 0 | 0 | 0 | 0 | 0 | 0 | 0 | 0 | 0 | 0 | 0 | 0 |
| 249.0 | 0 | 0 | 0 | 0 | 0 | 0 | 0 | 0 | 0 | 0 | 0 | 0 | 0 | 0 | 0 | 0 | 0 | 0 | 0 | 0 | 0 | 0 | 0 | 0 | 0 | 0 | 0 | 0 | 0 | 0 | 0 | 0 | 0 | 0 | 0 | 0 | 0 | 0 | 0 | 0 |
| 250.0 | 0 | 0 | 0 | 0 | 0 | 0 | 0 | 0 | 0 | 0 | 0 | 0 | 0 | 0 | 0 | 0 | 0 | 0 | 0 | 0 | 0 | 0 | 0 | 0 | 0 | 0 | 0 | 0 | 0 | 0 | 0 | 0 | 0 | 0 | 0 | 0 | 0 | 0 | 0 | 0 |
| 251.0 | 0 | 0 | 0 | 0 | 0 | 0 | 0 | 0 | 0 | 0 | 0 | 0 | 0 | 0 | 0 | 0 | 0 | 0 | 0 | 0 | 0 | 0 | 0 | 0 | 0 | 0 | 0 | 0 | 0 | 0 | 0 | 0 | 0 | 0 | 0 | 0 | 0 | 0 | 0 | 0 |
| 252.0 | 0 | 0 | 0 | 0 | 0 | 0 | 0 | 0 | 0 | 0 | 0 | 0 | 0 | 0 | 0 | 0 | 0 | 0 | 0 | 0 | 0 | 0 | 0 | 0 | 0 | 0 | 0 | 0 | 0 | 0 | 0 | 0 | 0 | 0 | 0 | 0 | 0 | 0 | 0 | 0 |
| 253.0 | 0 | 0 | 0 | 0 | 0 | 0 | 0 | 0 | 0 | 0 | 0 | 0 | 0 | 0 | 0 | 0 | 0 | 0 | 0 | 0 | 0 | 0 | 0 | 0 | 0 | 0 | 0 | 0 | 0 | 0 | 0 | 0 | 0 | 0 | 0 | 0 | 0 | 0 | 0 | 0 |
| 254.0 | 0 | 0 | 0 | 0 | 0 | 0 | 0 | 0 | 0 | 0 | 0 | 0 | 0 | 0 | 0 | 0 | 0 | 0 | 0 | 0 | 0 | 0 | 0 | 0 | 0 | 0 | 0 | 0 | 0 | 0 | 0 | 0 | 0 | 0 | 0 | 0 | 0 | 0 | 0 | 0 |
| 255.0 | 0 | 0 | 0 | 0 | 0 | 0 | 0 | 0 | 0 | 0 | 0 | 0 | 0 | 0 | 0 | 0 | 0 | 0 | 0 | 0 | 0 | 0 | 0 | 0 | 0 | 0 | 0 | 0 | 0 | 0 | 0 | 0 | 0 | 0 | 0 | 0 | 0 | 0 | 0 | 0 |
| 256.0 | 0 | 0 | 0 | 0 | 0 | 0 | 0 | 0 | 0 | 0 | 0 | 0 | 0 | 0 | 0 | 0 | 0 | 0 | 0 | 0 | 0 | 0 | 0 | 0 | 0 | 0 | 0 | 0 | 0 | 0 | 0 | 0 | 0 | 0 | 0 | 0 | 0 | 0 | 0 | 0 |
| 257.0 | 0 | 0 | 0 | 0 | 0 | 0 | 0 | 0 | 0 | 0 | 0 | 0 | 0 | 0 | 0 | 0 | 0 | 0 | 0 | 0 | 0 | 0 | 0 | 0 | 0 | 0 | 0 | 0 | 0 | 0 | 0 | 0 | 0 | 0 | 0 | 0 | 0 | 0 | 0 | 0 |
| 258.0 | 0 | 0 | 0 | 0 | 0 | 0 | 0 | 0 | 0 | 0 | 0 | 0 | 0 | 0 | 0 | 0 | 0 | 0 | 0 | 0 | 0 | 0 | 0 | 0 | 0 | 0 | 0 | 0 | 0 | 0 | 0 | 0 | 0 | 0 | 0 | 0 | 0 | 0 | 0 | 0 |
| 259.0 | 0 | 0 | 0 | 0 | 0 | 0 | 0 | 0 | 0 | 0 | 0 | 0 | 0 | 0 | 0 | 0 | 0 | 0 | 0 | 0 | 0 | 0 | 0 | 0 | 0 | 0 | 0 | 0 | 0 | 0 | 0 | 0 | 0 | 0 | 0 | 0 | 0 | 0 | 0 | 0 |
| 260.0 | 0 | 0 | 0 | 0 | 0 | 0 | 0 | 0 | 0 | 0 | 0 | 0 | 0 | 0 | 0 | 0 | 0 | 0 | 0 | 0 | 0 | 0 | 0 | 0 | 0 | 0 | 0 | 0 | 0 | 0 | 0 | 0 | 0 | 0 | 0 | 0 | 0 | 0 | 0 | 0 |
| 261.0 | 0 | 0 | 0 | 0 | 0 | 0 | 0 | 0 | 0 | 0 | 0 | 0 | 0 | 0 | 0 | 0 | 0 | 0 | 0 | 0 | 0 | 0 | 0 | 0 | 0 | 0 | 0 | 0 | 0 | 0 | 0 | 0 | 0 | 0 | 0 | 0 | 0 | 0 | 0 | 0 |
| 262.0 | 0 | 0 | 0 | 0 | 0 | 0 | 0 | 0 | 0 | 0 | 0 | 0 | 0 | 0 | 0 | 0 | 0 | 0 | 0 | 0 | 0 | 0 | 0 | 0 | 0 | 0 | 0 | 0 | 0 | 0 | 0 | 0 | 0 | 0 | 0 | 0 | 0 | 0 | 0 | 0 |
| 263.0 | 0 | 0 | 0 | 0 | 0 | 0 | 0 | 0 | 0 | 0 | 0 | 0 | 0 | 0 | 0 | 0 | 0 | 0 | 0 | 0 | 0 | 0 | 0 | 0 | 0 | 0 | 0 | 0 | 0 | 0 | 0 | 0 | 0 | 0 | 0 | 0 | 0 | 0 | 0 | 0 |
| 264.0 | 0 | 0 | 0 | 0 | 0 | 0 | 0 | 0 | 0 | 0 | 0 | 0 | 0 | 0 | 0 | 0 | 0 | 0 | 0 | 0 | 0 | 0 | 0 | 0 | 0 | 0 | 0 | 0 | 0 | 0 | 0 | 0 | 0 | 0 | 0 | 0 | 0 | 0 | 0 | 0 |
| 265.0 | 0 | 0 | 0 | 0 | 0 | 0 | 0 | 0 | 0 | 0 | 0 | 0 | 0 | 0 | 0 | 0 | 0 | 0 | 0 | 0 | 0 | 0 | 0 | 0 | 0 | 0 | 0 | 0 | 0 | 0 | 0 | 0 | 0 | 0 | 0 | 0 | 0 | 0 | 0 | 0 |
| 266.0 | 0 | 0 | 0 | 0 | 0 | 0 | 0 | 0 | 0 | 0 | 0 | 0 | 0 | 0 | 0 | 0 | 0 | 0 | 0 | 0 | 0 | 0 | 0 | 0 | 0 | 0 | 0 | 0 | 0 | 0 | 0 | 0 | 0 | 0 | 0 | 0 | 0 | 0 | 0 | 0 |
| 267.0 | 0 | 0 | 0 | 0 | 0 | 0 | 0 | 0 | 0 | 0 | 0 | 0 | 0 | 0 | 0 | 0 | 0 | 0 | 0 | 0 | 0 | 0 | 0 | 0 | 0 | 0 | 0 | 0 | 0 | 0 | 0 | 0 | 0 | 0 | 0 | 0 | 0 | 0 | 0 | 0 |
| 268.0 | 0 | 0 | 0 | 0 | 0 | 0 | 0 | 0 | 0 | 0 | 0 | 0 | 0 | 0 | 0 | 0 | 0 | 0 | 0 | 0 | 0 | 0 | 0 | 0 | 0 | 0 | 0 | 0 | 0 | 0 | 0 | 0 | 0 | 0 | 0 | 0 | 0 | 0 | 0 | 0 |
| 269.0 | 0 | 0 | 0 | 0 | 0 | 0 | 0 | 0 | 0 | 0 | 0 | 0 | 0 | 0 | 0 | 0 | 0 | 0 | 0 | 0 | 0 | 0 | 0 | 0 | 0 | 0 | 0 | 0 | 0 | 0 | 0 | 0 | 0 | 0 | 0 | 0 | 0 | 0 | 0 | 0 |
| 270.0 | 0 | 0 | 0 | 0 | 0 | 0 | 0 | 0 | 0 | 0 | 0 | 0 | 0 | 0 | 0 | 0 | 0 | 0 | 0 | 0 | 0 | 0 | 0 | 0 | 0 | 0 | 0 | 0 | 0 | 0 | 0 | 0 | 0 | 0 | 0 | 0 | 0 | 0 | 0 | 0 |
| 271.0 | 0 | 0 | 0 | 0 | 0 | 0 | 0 | 0 | 0 | 0 | 0 | 0 | 0 | 0 | 0 | 0 | 0 | 0 | 0 | 0 | 0 | 0 | 0 | 0 | 0 | 0 | 0 | 0 | 0 | 0 | 0 | 0 | 0 | 0 | 0 | 0 | 0 | 0 | 0 | 0 |
| 272.0 | 0 | 0 | 0 | 0 | 0 | 0 | 0 | 0 | 0 | 0 | 0 | 0 | 0 | 0 | 0 | 0 | 0 | 0 | 0 | 0 | 0 | 0 | 0 | 0 | 0 | 0 | 0 | 0 | 0 | 0 | 0 | 0 | 0 | 0 | 0 | 0 | 0 | 0 | 0 | 0 |
| 273.0 | 0 | 0 | 0 | 0 | 0 | 0 | 0 | 0 | 0 | 0 | 0 | 0 | 0 | 0 | 0 | 0 | 0 | 0 | 0 | 0 | 0 | 0 | 0 | 0 | 0 | 0 | 0 | 0 | 0 | 0 | 0 | 0 | 0 | 0 | 0 | 0 | 0 | 0 | 0 | 0 |
| 274.0 | 0 | 0 | 0 | 0 | 0 | 0 | 0 | 0 | 0 | 0 | 0 | 0 | 0 | 0 | 0 | 0 | 0 | 0 | 0 | 0 | 0 | 0 | 0 | 0 | 0 | 0 | 0 | 0 | 0 | 0 | 0 | 0 | 0 | 0 | 0 | 0 | 0 | 0 | 0 | 0 |
| 275.0 | 0 | 0 | 0 | 0 | 0 | 0 | 0 | 0 | 0 | 0 | 0 | 0 | 0 | 0 | 0 | 0 | 0 | 0 | 0 | 0 | 0 | 0 | 0 | 0 | 0 | 0 | 0 | 0 | 0 | 0 | 0 | 0 | 0 | 0 | 0 | 0 | 0 | 0 | 0 | 0 |
| 276.0 | 0 | 0 | 0 | 0 | 0 | 0 | 0 | 0 | 0 | 0 | 0 | 0 | 0 | 0 | 0 | 0 | 0 | 0 | 0 | 0 | 0 | 0 | 0 | 0 | 0 | 0 | 0 | 0 | 0 | 0 | 0 | 0 | 0 | 0 | 0 | 0 | 0 | 0 | 0 | 0 |
| 277.0 | 0 | 0 | 0 | 0 | 0 | 0 | 0 | 0 | 0 | 0 | 0 | 0 | 0 | 0 | 0 | 0 | 0 | 0 | 0 | 0 | 0 | 0 | 0 | 0 | 0 | 0 | 0 | 0 | 0 | 0 | 0 | 0 | 0 | 0 | 0 | 0 | 0 | 0 | 0 | 0 |
| 278.0 | 0 | 0 | 0 | 0 | 0 | 0 | 0 | 0 | 0 | 0 | 0 | 0 | 0 | 0 | 0 | 0 | 0 | 0 | 0 | 0 | 0 | 0 | 0 | 0 | 0 | 0 | 0 | 0 | 0 | 0 | 0 | 0 | 0 | 0 | 0 | 0 | 0 | 0 | 0 | 0 |
| 279.0 | 0 | 0 | 0 | 0 | 0 | 0 | 0 | 0 | 0 | 0 | 0 | 0 | 0 | 0 | 0 | 0 | 0 | 0 | 0 | 0 | 0 | 0 | 0 | 0 | 0 | 0 | 0 | 0 | 0 | 0 | 0 | 0 | 0 | 0 | 0 | 0 | 0 | 0 | 0 | 0 |
| 280.0 | 0 | 0 | 0 | 0 | 0 | 0 | 0 | 0 | 0 | 0 | 0 | 0 | 0 | 0 | 0 | 0 | 0 | 0 | 0 | 0 | 0 | 0 | 0 | 0 | 0 | 0 | 0 | 0 | 0 | 0 | 0 | 0 | 0 | 0 | 0 | 0 | 0 | 0 | 0 | 0 |
| 281.0 | 0 | 0 | 0 | 0 | 0 | 0 | 0 | 0 | 0 | 0 | 0 | 0 | 0 | 0 | 0 | 0 | 0 | 0 | 0 | 0 | 0 | 0 | 0 | 0 | 0 | 0 | 0 | 0 | 0 | 0 | 0 | 0 | 0 | 0 | 0 | 0 | 0 | 0 | 0 | 0 |
| 282.0 | 0 | 0 | 0 | 0 | 0 | 0 | 0 | 0 | 0 | 0 | 0 | 0 | 0 | 0 | 0 | 0 | 0 | 0 | 0 | 0 | 0 | 0 | 0 | 0 | 0 | 0 | 0 | 0 | 0 | 0 | 0 | 0 | 0 | 0 | 0 | 0 | 0 | 0 | 0 | 0 |
| 283.0 | 0 | 0 | 0 | 0 | 0 | 0 | 0 | 0 | 0 | 0 | 0 | 0 | 0 | 0 | 0 | 0 | 0 | 0 | 0 | 0 | 0 | 0 | 0 | 0 | 0 | 0 | 0 | 0 | 0 | 0 | 0 | 0 | 0 | 0 | 0 | 0 | 0 | 0 | 0 | 0 |
| 284.0 | 0 | 0 | 0 | 0 | 0 | 0 | 0 | 0 | 0 | 0 | 0 | 0 | 0 | 0 | 0 | 0 | 0 | 0 | 0 | 0 | 0 | 0 | 0 | 0 | 0 | 0 | 0 | 0 | 0 | 0 | 0 | 0 | 0 | 0 | 0 | 0 | 0 | 0 | 0 | 0 |
| 285.0 | 0 | 0 | 0 | 0 | 0 | 0 | 0 | 0 | 0 | 0 | 0 | 0 | 0 | 0 | 0 | 0 | 0 | 0 | 0 | 0 | 0 | 0 | 0 | 0 | 0 | 0 | 0 | 0 | 0 | 0 | 0 | 0 | 0 | 0 | 0 | 0 | 0 | 0 | 0 | 0 |
| 286.0 | 0 | 0 | 0 | 0 | 0 | 0 | 0 | 0 | 0 | 0 | 0 | 0 | 0 | 0 | 0 | 0 | 0 | 0 | 0 | 0 | 0 | 0 | 0 | 0 | 0 | 0 | 0 | 0 | 0 | 0 | 0 | 0 | 0 | 0 | 0 | 0 | 0 | 0 | 0 | 0 |
| 287.0 | 0 | 0 | 0 | 0 | 0 | 0 | 0 | 0 | 0 | 0 | 0 | 0 | 0 | 0 | 0 | 0 | 0 | 0 | 0 | 0 | 0 | 0 | 0 | 0 | 0 | 0 | 0 | 0 | 0 | 0 | 0 | 0 | 0 | 0 | 0 | 0 | 0 | 0 | 0 | 0 |
| 288.0 | 0 | 0 | 0 | 0 | 0 | 0 | 0 | 0 | 0 | 0 | 0 | 0 | 0 | 0 | 0 | 0 | 0 | 0 | 0 | 0 | 0 | 0 | 0 | 0 | 0 | 0 | 0 | 0 | 0 | 0 | 0 | 0 | 0 | 0 | 0 | 0 | 0 | 0 | 0 | 0 |
| 289.0 | 0 | 0 | 0 | 0 | 0 | 0 | 0 | 0 | 0 | 0 | 0 | 0 | 0 | 0 | 0 | 0 | 0 | 0 | 0 | 0 | 0 | 0 | 0 | 0 | 0 | 0 | 0 | 0 | 0 | 0 | 0 | 0 | 0 | 0 | 0 | 0 | 0 | 0 | 0 | 0 |
| 290.0 | 0 | 0 | 0 | 0 | 0 | 0 | 0 | 0 | 0 | 0 | 0 | 0 | 0 | 0 | 0 | 0 | 0 | 0 | 0 | 0 | 0 | 0 | 0 | 0 | 0 | 0 | 0 | 0 | 0 | 0 | 0 | 0 | 0 | 0 | 0 | 0 | 0 | 0 | 0 | 0 |
| 291.0 | 0 | 0 | 0 | 0 | 0 | 0 | 0 | 0 | 0 | 0 | 0 | 0 | 0 | 0 | 0 | 0 | 0 | 0 | 0 | 0 | 0 | 0 | 0 | 0 | 0 | 0 | 0 | 0 | 0 | 0 | 0 | 0 | 0 | 0 | 0 | 0 | 0 | 0 | 0 | 0 |
| 292.0 | 0 | 0 | 0 | 0 | 0 | 0 | 0 | 0 | 0 | 0 | 0 | 0 | 0 | 0 | 0 | 0 | 0 | 0 | 0 | 0 | 0 | 0 | 0 | 0 | 0 | 0 | 0 | 0 | 0 | 0 | 0 | 0 | 0 | 0 | 0 | 0 | 0 | 0 | 0 | 0 |
| 293.0 | 0 | 0 | 0 | 0 | 0 | 0 | 0 | 0 | 0 | 0 | 0 | 0 | 0 | 0 | 0 | 0 | 0 | 0 | 0 | 0 | 0 | 0 | 0 | 0 | 0 | 0 | 0 | 0 | 0 | 0 | 0 | 0 | 0 | 0 | 0 | 0 | 0 | 0 | 0 | 0 |
| 294.0 | 0 | 0 | 0 | 0 | 0 | 0 | 0 | 0 | 0 | 0 | 0 | 0 | 0 | 0 | 0 | 0 | 0 | 0 | 0 | 0 | 0 | 0 | 0 | 0 | 0 | 0 | 0 | 0 | 0 | 0 | 0 | 0 | 0 | 0 | 0 | 0 | 0 | 0 | 0 | 0 |
| 295.0 | 0 | 0 | 0 | 0 | 0 | 0 | 0 | 0 | 0 | 0 | 0 | 0 | 0 | 0 | 0 | 0 | 0 | 0 | 0 | 0 | 0 | 0 | 0 | 0 | 0 | 0 | 0 | 0 | 0 | 0 | 0 | 0 | 0 | 0 | 0 | 0 | 0 | 0 | 0 | 0 |
| 296.0 | 0 | 0 | 0 | 0 | 0 | 0 | 0 | 0 | 0 | 0 | 0 | 0 | 0 | 0 | 0 | 0 | 0 | 0 | 0 | 0 | 0 | 0 | 0 | 0 | 0 | 0 | 0 | 0 | 0 | 0 | 0 | 0 | 0 | 0 | 0 | 0 | 0 | 0 | 0 | 0 |
| 297.0 | 0 | 0 | 0 | 0 | 0 | 0 | 0 | 0 | 0 | 0 | 0 | 0 | 0 | 0 | 0 | 0 | 0 | 0 | 0 | 0 | 0 | 0 | 0 | 0 | 0 | 0 | 0 | 0 | 0 | 0 | 0 | 0 | 0 | 0 | 0 | 0 | 0 | 0 | 0 | 0 |
| 298.0 | 0 | 0 | 0 | 0 | 0 | 0 | 0 | 0 | 0 | 0 | 0 | 0 | 0 | 0 | 0 | 0 | 0 | 0 | 0 | 0 | 0 | 0 | 0 | 0 | 0 | 0 | 0 | 0 | 0 | 0 | 0 | 0 | 0 | 0 | 0 | 0 | 0 | 0 | 0 | 0 |
| 299.0 | 0 | 0 | 0 | 0 | 0 | 0 | 0 | 0 | 0 | 0 | 0 | 0 | 0 | 0 | 0 | 0 | 0 | 0 | 0 | 0 | 0 | 0 | 0 | 0 | 0 | 0 | 0 | 0 | 0 | 0 | 0 | 0 | 0 | 0 | 0 | 0 | 0 | 0 | 0 | 0 |
| 300.0 | 0 | 0 | 0 | 0 | 0 | 0 | 0 | 0 | 0 | 0 | 0 | 0 | 0 | 0 | 0 | 0 | 0 | 0 | 0 | 0 | 0 | 0 | 0 | 0 | 0 | 0 | 0 | 0 | 0 | 0 | 0 | 0 | 0 | 0 | 0 | 0 | 0 | 0 | 0 | 0 |
| 301.0 | 0 | 0 | 0 | 0 | 0 | 0 | 0 | 0 | 0 | 0 | 0 | 0 | 0 | 0 | 0 | 0 | 0 | 0 | 0 | 0 | 0 | 0 | 0 | 0 | 0 | 0 | 0 | 0 | 0 | 0 | 0 | 0 | 0 | 0 | 0 | 0 | 0 | 0 | 0 | 0 |
| 302.0 | 0 | 0 | 0 | 0 | 0 | 0 | 0 | 0 | 0 | 0 | 0 | 0 | 0 | 0 | 0 | 0 | 0 | 0 | 0 | 0 | 0 | 0 | 0 | 0 | 0 | 0 | 0 | 0 | 0 | 0 | 0 | 0 | 0 | 0 | 0 | 0 | 0 | 0 | 0 | 0 |
| 303.0 | 0 | 0 | 0 | 0 | 0 | 0 | 0 | 0 | 0 | 0 | 0 | 0 | 0 | 0 | 0 | 0 | 0 | 0 | 0 | 0 | 0 | 0 | 0 | 0 | 0 | 0 | 0 | 0 | 0 | 0 | 0 | 0 | 0 | 0 | 0 | 0 | 0 | 0 | 0 | 0 |
| 304.0 | 0 | 0 | 0 | 0 | 0 | 0 | 0 | 0 | 0 | 0 | 0 | 0 | 0 | 0 | 0 | 0 | 0 | 0 | 0 | 0 | 0 | 0 | 0 | 0 | 0 | 0 | 0 | 0 | 0 | 0 | 0 | 0 | 0 | 0 | 0 | 0 | 0 | 0 | 0 | 0 |
| 305.0 | 0 | 0 | 0 | 0 | 0 | 0 | 0 | 0 | 0 | 0 | 0 | 0 | 0 | 0 | 0 | 0 | 0 | 0 | 0 | 0 | 0 | 0 | 0 | 0 | 0 | 0 | 0 | 0 | 0 | 0 | 0 | 0 | 0 | 0 | 0 | 0 | 0 | 0 | 0 | 0 |
| 306.0 | 0 | 0 | 0 | 0 | 0 | 0 | 0 | 0 | 0 | 0 | 0 | 0 | 0 | 0 | 0 | 0 | 0 | 0 | 0 | 0 | 0 | 0 | 0 | 0 | 0 | 0 | 0 | 0 | 0 | 0 | 0 | 0 | 0 | 0 | 0 | 0 | 0 | 0 | 0 | 0 |
| 307.0 | 0 | 0 | 0 | 0 | 0 | 0 | 0 | 0 | 0 | 0 | 0 | 0 | 0 | 0 | 0 | 0 | 0 | 0 | 0 | 0 | 0 | 0 | 0 | 0 | 0 | 0 | 0 | 0 | 0 | 0 | 0 | 0 | 0 | 0 | 0 | 0 | 0 | 0 | 0 | 0 |
| 308.0 | 0 | 0 | 0 | 0 | 0 | 0 | 0 | 0 | 0 | 0 | 0 | 0 | 0 | 0 | 0 | 0 | 0 | 0 | 0 | 0 | 0 | 0 | 0 | 0 | 0 | 0 | 0 | 0 | 0 | 0 | 0 | 0 | 0 | 0 | 0 | 0 | 0 | 0 | 0 | 0 |
| 309.0 | 0 | 0 | 0 | 0 | 0 | 0 | 0 | 0 | 0 | 0 | 0 | 0 | 0 | 0 | 0 | 0 | 0 | 0 | 0 | 0 | 0 | 0 | 0 | 0 | 0 | 0 | 0 | 0 | 0 | 0 | 0 | 0 | 0 | 0 | 0 | 0 | 0 | 0 | 0 | 0 |
| 310.0 | 0 | 0 | 0 | 0 | 0 | 0 | 0 | 0 | 0 | 0 | 0 | 0 | 0 | 0 | 0 | 0 | 0 | 0 | 0 | 0 | 0 | 0 | 0 | 0 | 0 | 0 | 0 | 0 | 0 | 0 | 0 | 0 | 0 | 0 | 0 | 0 | 0 | 0 | 0 | 0 |
| 311.0 | 0 | 0 | 0 | 0 | 0 | 0 | 0 | 0 | 0 | 0 | 0 | 0 | 0 | 0 | 0 | 0 | 0 | 0 | 0 | 0 | 0 | 0 | 0 | 0 | 0 | 0 | 0 | 0 | 0 | 0 | 0 | 0 | 0 | 0 | 0 | 0 | 0 | 0 | 0 | 0 |
| 312.0 | 0 | 0 | 0 | 0 | 0 | 0 | 0 | 0 | 0 | 0 | 0 | 0 | 0 | 0 | 0 | 0 | 0 | 0 | 0 | 0 | 0 | 0 | 0 | 0 | 0 | 0 | 0 | 0 | 0 | 0 | 0 | 0 | 0 | 0 | 0 | 0 | 0 | 0 | 0 | 0 |
| 313.0 | 0 | 0 | 0 | 0 | 0 | 0 | 0 | 0 | 0 | 0 | 0 | 0 | 0 | 0 | 0 | 0 | 0 | 0 | 0 | 0 | 0 | 0 | 0 | 0 | 0 | 0 | 0 | 0 | 0 | 0 | 0 | 0 | 0 | 0 | 0 | 0 | 0 | 0 | 0 | 0 |
| 314.0 | 0 | 0 | 0 | 0 | 0 | 0 | 0 | 0 | 0 | 0 | 0 | 0 | 0 | 0 | 0 | 0 | 0 | 0 | 0 | 0 | 0 | 0 | 0 | 0 | 0 | 0 | 0 | 0 | 0 | 0 | 0 | 0 | 0 | 0 | 0 | 0 | 0 | 0 | 0 | 0 |
| 315.0 | 0 | 0 | 0 | 0 | 0 | 0 | 0 | 0 | 0 | 0 | 0 | 0 | 0 | 0 | 0 | 0 | 0 | 0 | 0 | 0 | 0 | 0 | 0 | 0 | 0 | 0 | 0 | 0 | 0 | 0 | 0 | 0 | 0 | 0 | 0 | 0 | 0 | 0 | 0 | 0 |
| 316.0 | 0 | 0 | 0 | 0 | 0 | 0 | 0 | 0 | 0 | 0 | 0 | 0 | 0 | 0 | 0 | 0 | 0 | 0 | 0 | 0 | 0 | 0 | 0 | 0 | 0 | 0 | 0 | 0 | 0 | 0 | 0 | 0 | 0 | 0 | 0 | 0 | 0 | 0 | 0 | 0 |
| 317.0 | 0 | 0 | 0 | 0 | 0 | 0 | 0 | 0 | 0 | 0 | 0 | 0 | 0 | 0 | 0 | 0 | 0 | 0 | 0 | 0 | 0 | 0 | 0 | 0 | 0 | 0 | 0 | 0 | 0 | 0 | 0 | 0 | 0 | 0 | 0 | 0 | 0 | 0 | 0 | 0 |
| 318.0 | 0 | 0 | 0 | 0 | 0 | 0 | 0 | 0 | 0 | 0 | 0 | 0 | 0 | 0 | 0 | 0 | 0 | 0 | 0 | 0 | 0 | 0 | 0 | 0 | 0 | 0 | 0 | 0 | 0 | 0 | 0 | 0 | 0 | 0 | 0 | 0 | 0 | 0 | 0 | 0 |
| 319.0 | 0 | 0 | 0 | 0 | 0 | 0 | 0 | 0 | 0 | 0 | 0 | 0 | 0 | 0 | 0 | 0 | 0 | 0 | 0 | 0 | 0 | 0 | 0 | 0 | 0 | 0 | 0 | 0 | 0 | 0 | 0 | 0 | 0 | 0 | 0 | 0 | 0 | 0 | 0 | 0 |
| 320.0 | 0 | 0 | 0 | 0 | 0 | 0 | 0 | 0 | 0 | 0 | 0 | 0 | 0 | 0 | 0 | 0 | 0 | 0 | 0 | 0 | 0 | 0 | 0 | 0 | 0 | 0 | 0 | 0 | 0 | 0 | 0 | 0 | 0 | 0 | 0 | 0 | 0 | 0 | 0 | 0 |
| 321.0 | 0 | 0 | 0 | 0 | 0 | 0 | 0 | 0 | 0 | 0 | 0 | 0 | 0 | 0 | 0 | 0 | 0 | 0 | 0 | 0 | 0 | 0 | 0 | 0 | 0 | 0 | 0 | 0 | 0 | 0 | 0 | 0 | 0 | 0 | 0 | 0 | 0 | 0 | 0 | 0 |
| 322.0 | 0 | 0 | 0 | 0 | 0 | 0 | 0 | 0 | 0 | 0 | 0 | 0 | 0 | 0 | 0 | 0 | 0 | 0 | 0 | 0 | 0 | 0 | 0 | 0 | 0 | 0 | 0 | 0 | 0 | 0 | 0 | 0 | 0 | 0 | 0 | 0 | 0 | 0 | 0 | 0 |
| 323.0 | 0 | 0 | 0 | 0 | 0 | 0 | 0 | 0 | 0 | 0 | 0 | 0 | 0 | 0 | 0 | 0 | 0 | 0 | 0 | 0 | 0 | 0 | 0 | 0 | 0 | 0 | 0 | 0 | 0 | 0 | 0 | 0 | 0 | 0 | 0 | 0 | 0 | 0 | 0 | 0 |
| 324.0 | 0 | 0 | 0 | 0 | 0 | 0 | 0 | 0 | 0 | 0 | 0 | 0 | 0 | 0 | 0 | 0 | 0 | 0 | 0 | 0 | 0 | 0 | 0 | 0 | 0 | 0 | 0 | 0 | 0 | 0 | 0 | 0 | 0 | 0 | 0 | 0 | 0 | 0 | 0 | 0 |
| 325.0 | 0 | 0 | 0 | 0 | 0 | 0 | 0 | 0 | 0 | 0 | 0 | 0 | 0 | 0 | 0 | 0 | 0 | 0 | 0 | 0 | 0 | 0 | 0 | 0 | 0 | 0 | 0 | 0 | 0 | 0 | 0 | 0 | 0 | 0 | 0 | 0 | 0 | 0 | 0 | 0 |
| 326.0 | 0 | 0 | 0 | 0 | 0 | 0 | 0 | 0 | 0 | 0 | 0 | 0 | 0 | 0 | 0 | 0 | 0 | 0 | 0 | 0 | 0 | 0 | 0 | 0 | 0 | 0 | 0 | 0 | 0 | 0 | 0 | 0 | 0 | 0 | 0 | 0 | 0 | 0 | 0 | 0 |
| 327.0 | 0 | 0 | 0 | 0 | 0 | 0 | 0 | 0 | 0 | 0 | 0 | 0 | 0 | 0 | 0 | 0 | 0 | 0 | 0 | 0 | 0 | 0 | 0 | 0 | 0 | 0 | 0 | 0 | 0 | 0 | 0 | 0 | 0 | 0 | 0 | 0 | 0 | 0 | 0 | 0 |
| 328.0 | 0 | 0 | 0 | 0 | 0 | 0 | 0 | 0 | 0 | 0 | 0 | 0 | 0 | 0 | 0 | 0 | 0 | 0 | 0 | 0 | 0 | 0 | 0 | 0 | 0 | 0 | 0 | 0 | 0 | 0 | 0 | 0 | 0 | 0 | 0 | 0 | 0 | 0 | 0 | 0 |
| 329.0 | 0 | 0 | 0 | 0 | 0 | 0 | 0 | 0 | 0 | 0 | 0 | 0 | 0 | 0 | 0 | 0 | 0 | 0 | 0 | 0 | 0 | 0 | 0 | 0 | 0 | 0 | 0 | 0 | 0 | 0 | 0 | 0 | 0 | 0 | 0 | 0 | 0 | 0 | 0 | 0 |
| 330.0 | 0 | 0 | 0 | 0 | 0 | 0 | 0 | 0 | 0 | 0 | 0 | 0 | 0 | 0 | 0 | 0 | 0 | 0 | 0 | 0 | 0 | 0 | 0 | 0 | 0 | 0 | 0 | 0 | 0 | 0 | 0 | 0 | 0 | 0 | 0 | 0 | 0 | 0 | 0 | 0 |
| 331.0 | 0 | 0 | 0 | 0 | 0 | 0 | 0 | 0 | 0 | 0 | 0 | 0 | 0 | 0 | 0 | 0 | 0 | 0 | 0 | 0 | 0 | 0 | 0 | 0 | 0 | 0 | 0 | 0 | 0 | 0 | 0 | 0 | 0 | 0 | 0 | 0 | 0 | 0 | 0 | 0 |
| 332.0 | 0 | 0 | 0 | 0 | 0 | 0 | 0 | 0 | 0 | 0 | 0 | 0 | 0 | 0 | 0 | 0 | 0 | 0 | 0 | 0 | 0 | 0 | 0 | 0 | 0 | 0 | 0 | 0 | 0 | 0 | 0 | 0 | 0 | 0 | 0 | 0 | 0 | 0 | 0 | 0 |
| 333.0 | 0 | 0 | 0 | 0 | 0 | 0 | 0 | 0 | 0 | 0 | 0 | 0 | 0 | 0 | 0 | 0 | 0 | 0 | 0 | 0 | 0 | 0 | 0 | 0 | 0 | 0 | 0 | 0 | 0 | 0 | 0 | 0 | 0 | 0 | 0 | 0 | 0 | 0 | 0 | 0 |
| 334.0 | 0 | 0 | 0 | 0 | 0 | 0 | 0 | 0 | 0 | 0 | 0 | 0 | 0 | 0 | 0 | 0 | 0 | 0 | 0 | 0 | 0 | 0 | 0 | 0 | 0 | 0 | 0 | 0 | 0 | 0 | 0 | 0 | 0 | 0 | 0 | 0 | 0 | 0 | 0 | 0 |
| 335.0 | 0 | 0 | 0 | 0 | 0 | 0 | 0 | 0 | 0 | 0 | 0 | 0 | 0 | 0 | 0 | 0 | 0 | 0 | 0 | 0 | 0 | 0 | 0 | 0 | 0 | 0 | 0 | 0 | 0 | 0 | 0 | 0 | 0 | 0 | 0 | 0 | 0 | 0 | 0 | 0 |
| 336.0 | 0 | 0 | 0 | 0 | 0 | 0 | 0 | 0 | 0 | 0 | 0 | 0 | 0 | 0 | 0 | 0 | 0 | 0 | 0 | 0 | 0 | 0 | 0 | 0 | 0 | 0 | 0 | 0 | 0 | 0 | 0 | 0 | 0 | 0 | 0 | 0 | 0 | 0 | 0 | 0 |
| 337.0 | 0 | 0 | 0 | 0 | 0 | 0 | 0 | 0 | 0 | 0 | 0 | 0 | 0 | 0 | 0 | 0 | 0 | 0 | 0 | 0 | 0 | 0 | 0 | 0 | 0 | 0 | 0 | 0 | 0 | 0 | 0 | 0 | 0 | 0 | 0 | 0 | 0 | 0 | 0 | 0 |
| 338.0 | 0 | 0 | 0 | 0 | 0 | 0 | 0 | 0 | 0 | 0 | 0 | 0 | 0 | 0 | 0 | 0 | 0 | 0 | 0 | 0 | 0 | 0 | 0 | 0 | 0 | 0 | 0 | 0 | 0 | 0 | 0 | 0 | 0 | 0 | 0 | 0 | 0 | 0 | 0 | 0 |
| 339.0 | 0 | 0 | 0 | 0 | 0 | 0 | 0 | 0 | 0 | 0 | 0 | 0 | 0 | 0 | 0 | 0 | 0 | 0 | 0 | 0 | 0 | 0 | 0 | 0 | 0 | 0 | 0 | 0 | 0 | 0 | 0 | 0 | 0 | 0 | 0 | 0 | 0 | 0 | 0 | 0 |
| 340.0 | 0 | 0 | 0 | 0 | 0 | 0 | 0 | 0 | 0 | 0 | 0 | 0 | 0 | 0 | 0 | 0 | 0 | 0 | 0 | 0 | 0 | 0 | 0 | 0 | 0 | 0 | 0 | 0 | 0 | 0 | 0 | 0 | 0 | 0 | 0 | 0 | 0 | 0 | 0 | 0 |
| 341.0 | 0 | 0 | 0 | 0 | 0 | 0 | 0 | 0 | 0 | 0 | 0 | 0 | 0 | 0 | 0 | 0 | 0 | 0 | 0 | 0 | 0 | 0 | 0 | 0 | 0 | 0 | 0 | 0 | 0 | 0 | 0 | 0 | 0 | 0 | 0 | 0 | 0 | 0 | 0 | 0 |
| 342.0 | 0 | 0 | 0 | 0 | 0 | 0 | 0 | 0 | 0 | 0 | 0 | 0 | 0 | 0 | 0 | 0 | 0 | 0 | 0 | 0 | 0 | 0 | 0 | 0 | 0 | 0 | 0 | 0 | 0 | 0 | 0 | 0 | 0 | 0 | 0 | 0 | 0 | 0 | 0 | 0 |
| 343.0 | 0 | 0 | 0 | 0 | 0 | 0 | 0 | 0 | 0 | 0 | 0 | 0 | 0 | 0 | 0 | 0 | 0 | 0 | 0 | 0 | 0 | 0 | 0 | 0 | 0 | 0 | 0 | 0 | 0 | 0 | 0 | 0 | 0 | 0 | 0 | 0 | 0 | 0 | 0 | 0 |
| 344.0 | 0 | 0 | 0 | 0 | 0 | 0 | 0 | 0 | 0 | 0 | 0 | 0 | 0 | 0 | 0 | 0 | 0 | 0 | 0 | 0 | 0 | 0 | 0 | 0 | 0 | 0 | 0 | 0 | 0 | 0 | 0 | 0 | 0 | 0 | 0 | 0 | 0 | 0 | 0 | 0 |
| 345.0 | 0 | 0 | 0 | 0 | 0 | 0 | 0 | 0 | 0 | 0 | 0 | 0 | 0 | 0 | 0 | 0 | 0 | 0 | 0 | 0 | 0 | 0 | 0 | 0 | 0 | 0 | 0 | 0 | 0 | 0 | 0 | 0 | 0 | 0 | 0 | 0 | 0 | 0 | 0 | 0 |
| 346.0 | 0 | 0 | 0 | 0 | 0 | 0 | 0 | 0 | 0 | 0 | 0 | 0 | 0 | 0 | 0 | 0 | 0 | 0 | 0 | 0 | 0 | 0 | 0 | 0 | 0 | 0 | 0 | 0 | 0 | 0 | 0 | 0 | 0 | 0 | 0 | 0 | 0 | 0 | 0 | 0 |
| 347.0 | 0 | 0 | 0 | 0 | 0 | 0 | 0 | 0 | 0 | 0 | 0 | 0 | 0 | 0 | 0 | 0 | 0 | 0 | 0 | 0 | 0 | 0 | 0 | 0 | 0 | 0 | 0 | 0 | 0 | 0 | 0 | 0 | 0 | 0 | 0 | 0 | 0 | 0 | 0 | 0 |
| 348.0 | 0 | 0 | 0 | 0 | 0 | 0 | 0 | 0 | 0 | 0 | 0 | 0 | 0 | 0 | 0 | 0 | 0 | 0 | 0 | 0 | 0 | 0 | 0 | 0 | 0 | 0 | 0 | 0 | 0 | 0 | 0 | 0 | 0 | 0 | 0 | 0 | 0 | 0 | 0 | 0 |
| 349.0 | 0 | 0 | 0 | 0 | 0 | 0 | 0 | 0 | 0 | 0 | 0 | 0 | 0 | 0 | 0 | 0 | 0 | 0 | 0 | 0 | 0 | 0 | 0 | 0 | 0 | 0 | 0 | 0 | 0 | 0 | 0 | 0 | 0 | 0 | 0 | 0 | 0 | 0 | 0 | 0 |
| 350.0 | 0 | 0 | 0 | 0 | 0 | 0 | 0 | 0 | 0 | 0 | 0 | 0 | 0 | 0 | 0 | 0 | 0 | 0 | 0 | 0 | 0 | 0 | 0 | 0 | 0 | 0 | 0 | 0 | 0 | 0 | 0 | 0 | 0 | 0 | 0 | 0 | 0 | 0 | 0 | 0 |
| 351.0 | 0 | 0 | 0 | 0 | 0 | 0 | 0 | 0 | 0 | 0 | 0 | 0 | 0 | 0 | 0 | 0 | 0 | 0 | 0 | 0 | 0 | 0 | 0 | 0 | 0 | 0 | 0 | 0 | 0 | 0 | 0 | 0 | 0 | 0 | 0 | 0 | 0 | 0 | 0 | 0 |
| 352.0 | 0 | 0 | 0 | 0 | 0 | 0 | 0 | 0 | 0 | 0 | 0 | 0 | 0 | 0 | 0 | 0 | 0 | 0 | 0 | 0 | 0 | 0 | 0 | 0 | 0 | 0 | 0 | 0 | 0 | 0 | 0 | 0 | 0 | 0 | 0 | 0 | 0 | 0 | 0 | 0 |
| 353.0 | 0 | 0 | 0 | 0 | 0 | 0 | 0 | 0 | 0 | 0 | 0 | 0 | 0 | 0 | 0 | 0 | 0 | 0 | 0 | 0 | 0 | 0 | 0 | 0 | 0 | 0 | 0 | 0 | 0 | 0 | 0 | 0 | 0 | 0 | 0 | 0 | 0 | 0 | 0 | 0 |
| 354.0 | 0 | 0 | 0 | 0 | 0 | 0 | 0 | 0 | 0 | 0 | 0 | 0 | 0 | 0 | 0 | 0 | 0 | 0 | 0 | 0 | 0 | 0 | 0 | 0 | 0 | 0 | 0 | 0 | 0 | 0 | 0 | 0 | 0 | 0 | 0 | 0 | 0 | 0 | 0 | 0 |
| 355.0 | 0 | 0 | 0 | 0 | 0 | 0 | 0 | 0 | 0 | 0 | 0 | 0 | 0 | 0 | 0 | 0 | 0 | 0 | 0 | 0 | 0 | 0 | 0 | 0 | 0 | 0 | 0 | 0 | 0 | 0 | 0 | 0 | 0 | 0 | 0 | 0 | 0 | 0 | 0 | 0 |
| 356.0 | 0 | 0 | 0 | 0 | 0 | 0 | 0 | 0 | 0 | 0 | 0 | 0 | 0 | 0 | 0 | 0 | 0 | 0 | 0 | 0 | 0 | 0 | 0 | 0 | 0 | 0 | 0 | 0 | 0 | 0 | 0 | 0 | 0 | 0 | 0 | 0 | 0 | 0 | 0 | 0 |
| 357.0 | 0 | 0 | 0 | 0 | 0 | 0 | 0 | 0 | 0 | 0 | 0 | 0 | 0 | 0 | 0 | 0 | 0 | 0 | 0 | 0 | 0 | 0 | 0 | 0 | 0 | 0 | 0 | 0 | 0 | 0 | 0 | 0 | 0 | 0 | 0 | 0 | 0 | 0 | 0 | 0 |
| 358.0 | 0 | 0 | 0 | 0 | 0 | 0 | 0 | 0 | 0 | 0 | 0 | 0 | 0 | 0 | 0 | 0 | 0 | 0 | 0 | 0 | 0 | 0 | 0 | 0 | 0 | 0 | 0 | 0 | 0 | 0 | 0 | 0 | 0 | 0 | 0 | 0 | 0 | 0 | 0 | 0 |
| 359.0 | 0 | 0 | 0 | 0 | 0 | 0 | 0 | 0 | 0 | 0 | 0 | 0 | 0 | 0 | 0 | 0 | 0 | 0 | 0 | 0 | 0 | 0 | 0 | 0 | 0 | 0 | 0 | 0 | 0 | 0 | 0 | 0 | 0 | 0 | 0 | 0 | 0 | 0 | 0 | 0 |
| 360.0 | 0 | 0 | 0 | 0 | 0 | 0 | 0 | 0 | 0 | 0 | 0 | 0 | 0 | 0 | 0 | 0 | 0 | 0 | 0 | 0 | 0 | 0 | 0 | 0 | 0 | 0 | 0 | 0 | 0 | 0 | 0 | 0 | 0 | 0 | 0 | 0 | 0 | 0 | 0 | 0 |